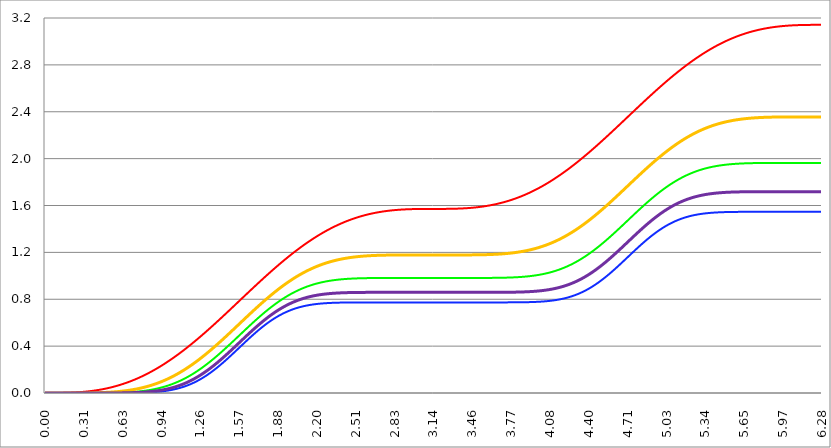
| Category | Series 1 | Series 0 | Series 2 | Series 3 | Series 4 |
|---|---|---|---|---|---|
| 0.0 | 0 | 0 | 0 | 0 | 0 |
| 0.00314159265358979 | 0 | 0 | 0 | 0 | 0 |
| 0.00628318530717958 | 0 | 0 | 0 | 0 | 0 |
| 0.00942477796076938 | 0 | 0 | 0 | 0 | 0 |
| 0.0125663706143592 | 0 | 0 | 0 | 0 | 0 |
| 0.015707963267949 | 0 | 0 | 0 | 0 | 0 |
| 0.0188495559215388 | 0 | 0 | 0 | 0 | 0 |
| 0.0219911485751285 | 0 | 0 | 0 | 0 | 0 |
| 0.0251327412287183 | 0 | 0 | 0 | 0 | 0 |
| 0.0282743338823081 | 0 | 0 | 0 | 0 | 0 |
| 0.0314159265358979 | 0 | 0 | 0 | 0 | 0 |
| 0.0345575191894877 | 0 | 0 | 0 | 0 | 0 |
| 0.0376991118430775 | 0 | 0 | 0 | 0 | 0 |
| 0.0408407044966673 | 0 | 0 | 0 | 0 | 0 |
| 0.0439822971502571 | 0 | 0 | 0 | 0 | 0 |
| 0.0471238898038469 | 0 | 0 | 0 | 0 | 0 |
| 0.0502654824574367 | 0 | 0 | 0 | 0 | 0 |
| 0.0534070751110265 | 0 | 0 | 0 | 0 | 0 |
| 0.0565486677646163 | 0 | 0 | 0 | 0 | 0 |
| 0.059690260418206 | 0 | 0 | 0 | 0 | 0 |
| 0.0628318530717958 | 0 | 0 | 0 | 0 | 0 |
| 0.0659734457253856 | 0 | 0 | 0 | 0 | 0 |
| 0.0691150383789754 | 0 | 0 | 0 | 0 | 0 |
| 0.0722566310325652 | 0 | 0 | 0 | 0 | 0 |
| 0.075398223686155 | 0 | 0 | 0 | 0 | 0 |
| 0.0785398163397448 | 0 | 0 | 0 | 0 | 0 |
| 0.0816814089933346 | 0 | 0 | 0 | 0 | 0 |
| 0.0848230016469244 | 0 | 0 | 0 | 0 | 0 |
| 0.0879645943005142 | 0 | 0 | 0 | 0 | 0 |
| 0.091106186954104 | 0 | 0 | 0 | 0 | 0 |
| 0.0942477796076937 | 0 | 0 | 0 | 0 | 0 |
| 0.0973893722612835 | 0 | 0 | 0 | 0 | 0 |
| 0.100530964914873 | 0 | 0 | 0 | 0 | 0 |
| 0.103672557568463 | 0 | 0 | 0 | 0 | 0 |
| 0.106814150222053 | 0 | 0 | 0 | 0 | 0 |
| 0.109955742875643 | 0 | 0 | 0 | 0 | 0 |
| 0.113097335529233 | 0 | 0 | 0 | 0 | 0 |
| 0.116238928182822 | 0.001 | 0 | 0 | 0 | 0 |
| 0.119380520836412 | 0.001 | 0 | 0 | 0 | 0 |
| 0.122522113490002 | 0.001 | 0 | 0 | 0 | 0 |
| 0.125663706143592 | 0.001 | 0 | 0 | 0 | 0 |
| 0.128805298797181 | 0.001 | 0 | 0 | 0 | 0 |
| 0.131946891450771 | 0.001 | 0 | 0 | 0 | 0 |
| 0.135088484104361 | 0.001 | 0 | 0 | 0 | 0 |
| 0.138230076757951 | 0.001 | 0 | 0 | 0 | 0 |
| 0.141371669411541 | 0.001 | 0 | 0 | 0 | 0 |
| 0.14451326206513 | 0.001 | 0 | 0 | 0 | 0 |
| 0.14765485471872 | 0.001 | 0 | 0 | 0 | 0 |
| 0.15079644737231 | 0.001 | 0 | 0 | 0 | 0 |
| 0.1539380400259 | 0.001 | 0 | 0 | 0 | 0 |
| 0.15707963267949 | 0.001 | 0 | 0 | 0 | 0 |
| 0.160221225333079 | 0.001 | 0 | 0 | 0 | 0 |
| 0.163362817986669 | 0.001 | 0 | 0 | 0 | 0 |
| 0.166504410640259 | 0.002 | 0 | 0 | 0 | 0 |
| 0.169646003293849 | 0.002 | 0 | 0 | 0 | 0 |
| 0.172787595947439 | 0.002 | 0 | 0 | 0 | 0 |
| 0.175929188601028 | 0.002 | 0 | 0 | 0 | 0 |
| 0.179070781254618 | 0.002 | 0 | 0 | 0 | 0 |
| 0.182212373908208 | 0.002 | 0 | 0 | 0 | 0 |
| 0.185353966561798 | 0.002 | 0 | 0 | 0 | 0 |
| 0.188495559215388 | 0.002 | 0 | 0 | 0 | 0 |
| 0.191637151868977 | 0.002 | 0 | 0 | 0 | 0 |
| 0.194778744522567 | 0.002 | 0 | 0 | 0 | 0 |
| 0.197920337176157 | 0.003 | 0 | 0 | 0 | 0 |
| 0.201061929829747 | 0.003 | 0 | 0 | 0 | 0 |
| 0.204203522483336 | 0.003 | 0 | 0 | 0 | 0 |
| 0.207345115136926 | 0.003 | 0 | 0 | 0 | 0 |
| 0.210486707790516 | 0.003 | 0 | 0 | 0 | 0 |
| 0.213628300444106 | 0.003 | 0 | 0 | 0 | 0 |
| 0.216769893097696 | 0.003 | 0 | 0 | 0 | 0 |
| 0.219911485751285 | 0.004 | 0 | 0 | 0 | 0 |
| 0.223053078404875 | 0.004 | 0 | 0 | 0 | 0 |
| 0.226194671058465 | 0.004 | 0 | 0 | 0 | 0 |
| 0.229336263712055 | 0.004 | 0 | 0 | 0 | 0 |
| 0.232477856365645 | 0.004 | 0 | 0 | 0 | 0 |
| 0.235619449019234 | 0.004 | 0 | 0 | 0 | 0 |
| 0.238761041672824 | 0.004 | 0 | 0 | 0 | 0 |
| 0.241902634326414 | 0.005 | 0 | 0 | 0 | 0 |
| 0.245044226980004 | 0.005 | 0 | 0 | 0 | 0 |
| 0.248185819633594 | 0.005 | 0 | 0 | 0 | 0 |
| 0.251327412287183 | 0.005 | 0 | 0 | 0 | 0 |
| 0.254469004940773 | 0.005 | 0 | 0 | 0 | 0 |
| 0.257610597594363 | 0.006 | 0 | 0 | 0 | 0 |
| 0.260752190247953 | 0.006 | 0 | 0 | 0 | 0 |
| 0.263893782901543 | 0.006 | 0 | 0 | 0 | 0 |
| 0.267035375555132 | 0.006 | 0 | 0 | 0 | 0 |
| 0.270176968208722 | 0.006 | 0 | 0 | 0 | 0 |
| 0.273318560862312 | 0.007 | 0 | 0 | 0 | 0 |
| 0.276460153515902 | 0.007 | 0 | 0 | 0 | 0 |
| 0.279601746169492 | 0.007 | 0 | 0 | 0 | 0 |
| 0.282743338823082 | 0.007 | 0 | 0 | 0 | 0 |
| 0.285884931476671 | 0.008 | 0 | 0 | 0 | 0 |
| 0.289026524130261 | 0.008 | 0 | 0 | 0 | 0 |
| 0.292168116783851 | 0.008 | 0 | 0 | 0 | 0 |
| 0.295309709437441 | 0.008 | 0 | 0 | 0 | 0 |
| 0.298451302091031 | 0.009 | 0 | 0 | 0 | 0 |
| 0.30159289474462 | 0.009 | 0 | 0 | 0 | 0 |
| 0.30473448739821 | 0.009 | 0 | 0 | 0.001 | 0 |
| 0.3078760800518 | 0.01 | 0 | 0 | 0.001 | 0 |
| 0.31101767270539 | 0.01 | 0 | 0 | 0.001 | 0 |
| 0.31415926535898 | 0.01 | 0 | 0 | 0.001 | 0 |
| 0.31730085801257 | 0.01 | 0 | 0 | 0.001 | 0 |
| 0.320442450666159 | 0.011 | 0 | 0 | 0.001 | 0 |
| 0.323584043319749 | 0.011 | 0 | 0 | 0.001 | 0 |
| 0.326725635973339 | 0.011 | 0 | 0 | 0.001 | 0 |
| 0.329867228626929 | 0.012 | 0 | 0 | 0.001 | 0 |
| 0.333008821280519 | 0.012 | 0 | 0 | 0.001 | 0 |
| 0.336150413934108 | 0.012 | 0 | 0 | 0.001 | 0 |
| 0.339292006587698 | 0.013 | 0 | 0 | 0.001 | 0 |
| 0.342433599241288 | 0.013 | 0 | 0 | 0.001 | 0 |
| 0.345575191894878 | 0.013 | 0 | 0 | 0.001 | 0 |
| 0.348716784548468 | 0.014 | 0 | 0 | 0.001 | 0 |
| 0.351858377202058 | 0.014 | 0 | 0 | 0.001 | 0 |
| 0.354999969855647 | 0.015 | 0 | 0 | 0.001 | 0 |
| 0.358141562509237 | 0.015 | 0 | 0 | 0.001 | 0 |
| 0.361283155162827 | 0.015 | 0 | 0 | 0.001 | 0 |
| 0.364424747816417 | 0.016 | 0 | 0 | 0.001 | 0 |
| 0.367566340470007 | 0.016 | 0 | 0 | 0.001 | 0 |
| 0.370707933123597 | 0.017 | 0 | 0 | 0.001 | 0 |
| 0.373849525777186 | 0.017 | 0 | 0 | 0.001 | 0 |
| 0.376991118430776 | 0.017 | 0 | 0 | 0.001 | 0 |
| 0.380132711084366 | 0.018 | 0 | 0 | 0.001 | 0 |
| 0.383274303737956 | 0.018 | 0 | 0 | 0.002 | 0 |
| 0.386415896391546 | 0.019 | 0 | 0 | 0.002 | 0 |
| 0.389557489045135 | 0.019 | 0 | 0 | 0.002 | 0 |
| 0.392699081698725 | 0.02 | 0 | 0 | 0.002 | 0 |
| 0.395840674352315 | 0.02 | 0 | 0 | 0.002 | 0 |
| 0.398982267005905 | 0.021 | 0 | 0 | 0.002 | 0 |
| 0.402123859659495 | 0.021 | 0 | 0 | 0.002 | 0 |
| 0.405265452313085 | 0.021 | 0 | 0 | 0.002 | 0 |
| 0.408407044966674 | 0.022 | 0 | 0 | 0.002 | 0 |
| 0.411548637620264 | 0.022 | 0 | 0 | 0.002 | 0 |
| 0.414690230273854 | 0.023 | 0 | 0 | 0.002 | 0 |
| 0.417831822927444 | 0.023 | 0 | 0 | 0.002 | 0 |
| 0.420973415581034 | 0.024 | 0 | 0 | 0.002 | 0 |
| 0.424115008234623 | 0.025 | 0 | 0 | 0.003 | 0 |
| 0.427256600888213 | 0.025 | 0 | 0 | 0.003 | 0 |
| 0.430398193541803 | 0.026 | 0 | 0 | 0.003 | 0 |
| 0.433539786195393 | 0.026 | 0 | 0 | 0.003 | 0 |
| 0.436681378848983 | 0.027 | 0 | 0 | 0.003 | 0 |
| 0.439822971502573 | 0.027 | 0 | 0 | 0.003 | 0 |
| 0.442964564156162 | 0.028 | 0 | 0 | 0.003 | 0 |
| 0.446106156809752 | 0.028 | 0 | 0 | 0.003 | 0 |
| 0.449247749463342 | 0.029 | 0 | 0 | 0.003 | 0 |
| 0.452389342116932 | 0.03 | 0 | 0 | 0.003 | 0 |
| 0.455530934770522 | 0.03 | 0 | 0 | 0.004 | 0 |
| 0.458672527424111 | 0.031 | 0.001 | 0 | 0.004 | 0 |
| 0.461814120077701 | 0.031 | 0.001 | 0 | 0.004 | 0 |
| 0.464955712731291 | 0.032 | 0.001 | 0 | 0.004 | 0 |
| 0.468097305384881 | 0.033 | 0.001 | 0 | 0.004 | 0 |
| 0.471238898038471 | 0.033 | 0.001 | 0 | 0.004 | 0 |
| 0.474380490692061 | 0.034 | 0.001 | 0 | 0.004 | 0 |
| 0.47752208334565 | 0.035 | 0.001 | 0 | 0.004 | 0 |
| 0.48066367599924 | 0.035 | 0.001 | 0 | 0.005 | 0 |
| 0.48380526865283 | 0.036 | 0.001 | 0 | 0.005 | 0 |
| 0.48694686130642 | 0.037 | 0.001 | 0 | 0.005 | 0 |
| 0.49008845396001 | 0.037 | 0.001 | 0 | 0.005 | 0 |
| 0.493230046613599 | 0.038 | 0.001 | 0 | 0.005 | 0 |
| 0.496371639267189 | 0.039 | 0.001 | 0 | 0.005 | 0 |
| 0.499513231920779 | 0.04 | 0.001 | 0 | 0.006 | 0 |
| 0.502654824574369 | 0.04 | 0.001 | 0 | 0.006 | 0 |
| 0.505796417227959 | 0.041 | 0.001 | 0 | 0.006 | 0 |
| 0.508938009881549 | 0.042 | 0.001 | 0 | 0.006 | 0 |
| 0.512079602535138 | 0.042 | 0.001 | 0 | 0.006 | 0 |
| 0.515221195188728 | 0.043 | 0.001 | 0 | 0.006 | 0 |
| 0.518362787842318 | 0.044 | 0.001 | 0 | 0.007 | 0 |
| 0.521504380495908 | 0.045 | 0.001 | 0 | 0.007 | 0 |
| 0.524645973149498 | 0.046 | 0.001 | 0 | 0.007 | 0 |
| 0.527787565803087 | 0.046 | 0.001 | 0 | 0.007 | 0 |
| 0.530929158456677 | 0.047 | 0.001 | 0 | 0.007 | 0 |
| 0.534070751110267 | 0.048 | 0.001 | 0 | 0.008 | 0 |
| 0.537212343763857 | 0.049 | 0.001 | 0 | 0.008 | 0 |
| 0.540353936417447 | 0.05 | 0.002 | 0 | 0.008 | 0 |
| 0.543495529071037 | 0.05 | 0.002 | 0 | 0.008 | 0 |
| 0.546637121724626 | 0.051 | 0.002 | 0 | 0.008 | 0 |
| 0.549778714378216 | 0.052 | 0.002 | 0 | 0.009 | 0 |
| 0.552920307031806 | 0.053 | 0.002 | 0 | 0.009 | 0 |
| 0.556061899685396 | 0.054 | 0.002 | 0 | 0.009 | 0 |
| 0.559203492338986 | 0.055 | 0.002 | 0 | 0.009 | 0 |
| 0.562345084992576 | 0.056 | 0.002 | 0 | 0.01 | 0 |
| 0.565486677646165 | 0.057 | 0.002 | 0 | 0.01 | 0 |
| 0.568628270299755 | 0.057 | 0.002 | 0 | 0.01 | 0 |
| 0.571769862953345 | 0.058 | 0.002 | 0 | 0.01 | 0.001 |
| 0.574911455606935 | 0.059 | 0.002 | 0 | 0.011 | 0.001 |
| 0.578053048260525 | 0.06 | 0.002 | 0 | 0.011 | 0.001 |
| 0.581194640914114 | 0.061 | 0.002 | 0 | 0.011 | 0.001 |
| 0.584336233567704 | 0.062 | 0.003 | 0 | 0.012 | 0.001 |
| 0.587477826221294 | 0.063 | 0.003 | 0 | 0.012 | 0.001 |
| 0.590619418874884 | 0.064 | 0.003 | 0 | 0.012 | 0.001 |
| 0.593761011528474 | 0.065 | 0.003 | 0 | 0.012 | 0.001 |
| 0.596902604182064 | 0.066 | 0.003 | 0 | 0.013 | 0.001 |
| 0.600044196835653 | 0.067 | 0.003 | 0 | 0.013 | 0.001 |
| 0.603185789489243 | 0.068 | 0.003 | 0 | 0.013 | 0.001 |
| 0.606327382142833 | 0.069 | 0.003 | 0 | 0.014 | 0.001 |
| 0.609468974796423 | 0.07 | 0.003 | 0 | 0.014 | 0.001 |
| 0.612610567450013 | 0.071 | 0.003 | 0 | 0.014 | 0.001 |
| 0.615752160103602 | 0.072 | 0.004 | 0 | 0.015 | 0.001 |
| 0.618893752757192 | 0.073 | 0.004 | 0 | 0.015 | 0.001 |
| 0.622035345410782 | 0.074 | 0.004 | 0 | 0.015 | 0.001 |
| 0.625176938064372 | 0.075 | 0.004 | 0 | 0.016 | 0.001 |
| 0.628318530717962 | 0.076 | 0.004 | 0 | 0.016 | 0.001 |
| 0.631460123371551 | 0.077 | 0.004 | 0 | 0.017 | 0.001 |
| 0.634601716025141 | 0.079 | 0.004 | 0 | 0.017 | 0.001 |
| 0.637743308678731 | 0.08 | 0.004 | 0 | 0.017 | 0.001 |
| 0.640884901332321 | 0.081 | 0.005 | 0 | 0.018 | 0.001 |
| 0.644026493985911 | 0.082 | 0.005 | 0 | 0.018 | 0.001 |
| 0.647168086639501 | 0.083 | 0.005 | 0 | 0.019 | 0.001 |
| 0.65030967929309 | 0.084 | 0.005 | 0 | 0.019 | 0.001 |
| 0.65345127194668 | 0.085 | 0.005 | 0 | 0.019 | 0.002 |
| 0.65659286460027 | 0.087 | 0.005 | 0 | 0.02 | 0.002 |
| 0.65973445725386 | 0.088 | 0.006 | 0.001 | 0.02 | 0.002 |
| 0.66287604990745 | 0.089 | 0.006 | 0.001 | 0.021 | 0.002 |
| 0.666017642561039 | 0.09 | 0.006 | 0.001 | 0.021 | 0.002 |
| 0.669159235214629 | 0.091 | 0.006 | 0.001 | 0.022 | 0.002 |
| 0.672300827868219 | 0.093 | 0.006 | 0.001 | 0.022 | 0.002 |
| 0.675442420521809 | 0.094 | 0.006 | 0.001 | 0.023 | 0.002 |
| 0.678584013175399 | 0.095 | 0.007 | 0.001 | 0.023 | 0.002 |
| 0.681725605828989 | 0.096 | 0.007 | 0.001 | 0.024 | 0.002 |
| 0.684867198482578 | 0.097 | 0.007 | 0.001 | 0.024 | 0.002 |
| 0.688008791136168 | 0.099 | 0.007 | 0.001 | 0.025 | 0.002 |
| 0.691150383789758 | 0.1 | 0.007 | 0.001 | 0.025 | 0.002 |
| 0.694291976443348 | 0.101 | 0.008 | 0.001 | 0.026 | 0.002 |
| 0.697433569096938 | 0.103 | 0.008 | 0.001 | 0.026 | 0.003 |
| 0.700575161750528 | 0.104 | 0.008 | 0.001 | 0.027 | 0.003 |
| 0.703716754404117 | 0.105 | 0.008 | 0.001 | 0.027 | 0.003 |
| 0.706858347057707 | 0.107 | 0.009 | 0.001 | 0.028 | 0.003 |
| 0.709999939711297 | 0.108 | 0.009 | 0.001 | 0.028 | 0.003 |
| 0.713141532364887 | 0.109 | 0.009 | 0.001 | 0.029 | 0.003 |
| 0.716283125018477 | 0.111 | 0.009 | 0.001 | 0.03 | 0.003 |
| 0.719424717672066 | 0.112 | 0.01 | 0.001 | 0.03 | 0.003 |
| 0.722566310325656 | 0.113 | 0.01 | 0.001 | 0.031 | 0.003 |
| 0.725707902979246 | 0.115 | 0.01 | 0.001 | 0.031 | 0.003 |
| 0.728849495632836 | 0.116 | 0.01 | 0.001 | 0.032 | 0.004 |
| 0.731991088286426 | 0.117 | 0.011 | 0.001 | 0.033 | 0.004 |
| 0.735132680940016 | 0.119 | 0.011 | 0.001 | 0.033 | 0.004 |
| 0.738274273593605 | 0.12 | 0.011 | 0.001 | 0.034 | 0.004 |
| 0.741415866247195 | 0.122 | 0.011 | 0.002 | 0.034 | 0.004 |
| 0.744557458900785 | 0.123 | 0.012 | 0.002 | 0.035 | 0.004 |
| 0.747699051554375 | 0.125 | 0.012 | 0.002 | 0.036 | 0.004 |
| 0.750840644207965 | 0.126 | 0.012 | 0.002 | 0.036 | 0.005 |
| 0.753982236861554 | 0.127 | 0.013 | 0.002 | 0.037 | 0.005 |
| 0.757123829515144 | 0.129 | 0.013 | 0.002 | 0.038 | 0.005 |
| 0.760265422168734 | 0.13 | 0.013 | 0.002 | 0.039 | 0.005 |
| 0.763407014822324 | 0.132 | 0.014 | 0.002 | 0.039 | 0.005 |
| 0.766548607475914 | 0.133 | 0.014 | 0.002 | 0.04 | 0.005 |
| 0.769690200129504 | 0.135 | 0.014 | 0.002 | 0.041 | 0.006 |
| 0.772831792783093 | 0.136 | 0.015 | 0.002 | 0.041 | 0.006 |
| 0.775973385436683 | 0.138 | 0.015 | 0.002 | 0.042 | 0.006 |
| 0.779114978090273 | 0.14 | 0.015 | 0.002 | 0.043 | 0.006 |
| 0.782256570743863 | 0.141 | 0.016 | 0.003 | 0.044 | 0.006 |
| 0.785398163397453 | 0.143 | 0.016 | 0.003 | 0.045 | 0.006 |
| 0.788539756051042 | 0.144 | 0.017 | 0.003 | 0.045 | 0.007 |
| 0.791681348704632 | 0.146 | 0.017 | 0.003 | 0.046 | 0.007 |
| 0.794822941358222 | 0.147 | 0.017 | 0.003 | 0.047 | 0.007 |
| 0.797964534011812 | 0.149 | 0.018 | 0.003 | 0.048 | 0.007 |
| 0.801106126665402 | 0.151 | 0.018 | 0.003 | 0.049 | 0.007 |
| 0.804247719318992 | 0.152 | 0.019 | 0.003 | 0.049 | 0.008 |
| 0.807389311972581 | 0.154 | 0.019 | 0.003 | 0.05 | 0.008 |
| 0.810530904626171 | 0.156 | 0.02 | 0.004 | 0.051 | 0.008 |
| 0.813672497279761 | 0.157 | 0.02 | 0.004 | 0.052 | 0.008 |
| 0.816814089933351 | 0.159 | 0.021 | 0.004 | 0.053 | 0.009 |
| 0.819955682586941 | 0.161 | 0.021 | 0.004 | 0.054 | 0.009 |
| 0.823097275240531 | 0.162 | 0.022 | 0.004 | 0.055 | 0.009 |
| 0.82623886789412 | 0.164 | 0.022 | 0.004 | 0.056 | 0.009 |
| 0.82938046054771 | 0.166 | 0.023 | 0.004 | 0.057 | 0.01 |
| 0.8325220532013 | 0.167 | 0.023 | 0.005 | 0.057 | 0.01 |
| 0.83566364585489 | 0.169 | 0.024 | 0.005 | 0.058 | 0.01 |
| 0.83880523850848 | 0.171 | 0.024 | 0.005 | 0.059 | 0.011 |
| 0.841946831162069 | 0.173 | 0.025 | 0.005 | 0.06 | 0.011 |
| 0.845088423815659 | 0.174 | 0.025 | 0.005 | 0.061 | 0.011 |
| 0.848230016469249 | 0.176 | 0.026 | 0.005 | 0.062 | 0.011 |
| 0.851371609122839 | 0.178 | 0.026 | 0.006 | 0.063 | 0.012 |
| 0.854513201776429 | 0.18 | 0.027 | 0.006 | 0.064 | 0.012 |
| 0.857654794430019 | 0.181 | 0.027 | 0.006 | 0.065 | 0.012 |
| 0.860796387083608 | 0.183 | 0.028 | 0.006 | 0.066 | 0.013 |
| 0.863937979737198 | 0.185 | 0.029 | 0.006 | 0.067 | 0.013 |
| 0.867079572390788 | 0.187 | 0.029 | 0.007 | 0.068 | 0.013 |
| 0.870221165044378 | 0.189 | 0.03 | 0.007 | 0.07 | 0.014 |
| 0.873362757697968 | 0.191 | 0.031 | 0.007 | 0.071 | 0.014 |
| 0.876504350351557 | 0.192 | 0.031 | 0.007 | 0.072 | 0.015 |
| 0.879645943005147 | 0.194 | 0.032 | 0.007 | 0.073 | 0.015 |
| 0.882787535658737 | 0.196 | 0.032 | 0.008 | 0.074 | 0.015 |
| 0.885929128312327 | 0.198 | 0.033 | 0.008 | 0.075 | 0.016 |
| 0.889070720965917 | 0.2 | 0.034 | 0.008 | 0.076 | 0.016 |
| 0.892212313619507 | 0.202 | 0.035 | 0.008 | 0.077 | 0.017 |
| 0.895353906273096 | 0.204 | 0.035 | 0.009 | 0.078 | 0.017 |
| 0.898495498926686 | 0.206 | 0.036 | 0.009 | 0.08 | 0.017 |
| 0.901637091580276 | 0.208 | 0.037 | 0.009 | 0.081 | 0.018 |
| 0.904778684233866 | 0.209 | 0.037 | 0.009 | 0.082 | 0.018 |
| 0.907920276887456 | 0.211 | 0.038 | 0.01 | 0.083 | 0.019 |
| 0.911061869541045 | 0.213 | 0.039 | 0.01 | 0.084 | 0.019 |
| 0.914203462194635 | 0.215 | 0.04 | 0.01 | 0.086 | 0.02 |
| 0.917345054848225 | 0.217 | 0.04 | 0.011 | 0.087 | 0.02 |
| 0.920486647501815 | 0.219 | 0.041 | 0.011 | 0.088 | 0.021 |
| 0.923628240155405 | 0.221 | 0.042 | 0.011 | 0.089 | 0.021 |
| 0.926769832808995 | 0.223 | 0.043 | 0.012 | 0.091 | 0.022 |
| 0.929911425462584 | 0.225 | 0.044 | 0.012 | 0.092 | 0.022 |
| 0.933053018116174 | 0.227 | 0.045 | 0.012 | 0.093 | 0.023 |
| 0.936194610769764 | 0.229 | 0.045 | 0.013 | 0.095 | 0.023 |
| 0.939336203423354 | 0.231 | 0.046 | 0.013 | 0.096 | 0.024 |
| 0.942477796076944 | 0.233 | 0.047 | 0.013 | 0.097 | 0.025 |
| 0.945619388730533 | 0.236 | 0.048 | 0.014 | 0.099 | 0.025 |
| 0.948760981384123 | 0.238 | 0.049 | 0.014 | 0.1 | 0.026 |
| 0.951902574037713 | 0.24 | 0.05 | 0.015 | 0.101 | 0.026 |
| 0.955044166691303 | 0.242 | 0.051 | 0.015 | 0.103 | 0.027 |
| 0.958185759344893 | 0.244 | 0.052 | 0.015 | 0.104 | 0.028 |
| 0.961327351998483 | 0.246 | 0.053 | 0.016 | 0.106 | 0.028 |
| 0.964468944652072 | 0.248 | 0.054 | 0.016 | 0.107 | 0.029 |
| 0.967610537305662 | 0.25 | 0.055 | 0.017 | 0.108 | 0.03 |
| 0.970752129959252 | 0.252 | 0.056 | 0.017 | 0.11 | 0.03 |
| 0.973893722612842 | 0.255 | 0.057 | 0.018 | 0.111 | 0.031 |
| 0.977035315266432 | 0.257 | 0.058 | 0.018 | 0.113 | 0.032 |
| 0.980176907920022 | 0.259 | 0.059 | 0.019 | 0.114 | 0.032 |
| 0.983318500573611 | 0.261 | 0.06 | 0.019 | 0.116 | 0.033 |
| 0.986460093227201 | 0.263 | 0.061 | 0.02 | 0.117 | 0.034 |
| 0.989601685880791 | 0.265 | 0.062 | 0.02 | 0.119 | 0.034 |
| 0.992743278534381 | 0.268 | 0.063 | 0.021 | 0.12 | 0.035 |
| 0.995884871187971 | 0.27 | 0.064 | 0.021 | 0.122 | 0.036 |
| 0.99902646384156 | 0.272 | 0.065 | 0.022 | 0.124 | 0.037 |
| 1.00216805649515 | 0.274 | 0.066 | 0.022 | 0.125 | 0.038 |
| 1.00530964914874 | 0.276 | 0.067 | 0.023 | 0.127 | 0.038 |
| 1.00845124180233 | 0.279 | 0.068 | 0.023 | 0.128 | 0.039 |
| 1.01159283445592 | 0.281 | 0.07 | 0.024 | 0.13 | 0.04 |
| 1.01473442710951 | 0.283 | 0.071 | 0.025 | 0.132 | 0.041 |
| 1.017876019763099 | 0.285 | 0.072 | 0.025 | 0.133 | 0.042 |
| 1.021017612416689 | 0.288 | 0.073 | 0.026 | 0.135 | 0.043 |
| 1.02415920507028 | 0.29 | 0.074 | 0.027 | 0.137 | 0.043 |
| 1.027300797723869 | 0.292 | 0.076 | 0.027 | 0.138 | 0.044 |
| 1.030442390377459 | 0.295 | 0.077 | 0.028 | 0.14 | 0.045 |
| 1.033583983031048 | 0.297 | 0.078 | 0.029 | 0.142 | 0.046 |
| 1.036725575684638 | 0.299 | 0.079 | 0.029 | 0.143 | 0.047 |
| 1.039867168338228 | 0.302 | 0.081 | 0.03 | 0.145 | 0.048 |
| 1.043008760991818 | 0.304 | 0.082 | 0.031 | 0.147 | 0.049 |
| 1.046150353645408 | 0.306 | 0.083 | 0.031 | 0.149 | 0.05 |
| 1.049291946298998 | 0.309 | 0.085 | 0.032 | 0.15 | 0.051 |
| 1.052433538952587 | 0.311 | 0.086 | 0.033 | 0.152 | 0.052 |
| 1.055575131606177 | 0.313 | 0.087 | 0.034 | 0.154 | 0.053 |
| 1.058716724259767 | 0.316 | 0.089 | 0.034 | 0.156 | 0.054 |
| 1.061858316913357 | 0.318 | 0.09 | 0.035 | 0.158 | 0.055 |
| 1.064999909566947 | 0.321 | 0.091 | 0.036 | 0.159 | 0.056 |
| 1.068141502220536 | 0.323 | 0.093 | 0.037 | 0.161 | 0.057 |
| 1.071283094874126 | 0.325 | 0.094 | 0.038 | 0.163 | 0.058 |
| 1.074424687527716 | 0.328 | 0.096 | 0.039 | 0.165 | 0.06 |
| 1.077566280181306 | 0.33 | 0.097 | 0.04 | 0.167 | 0.061 |
| 1.080707872834896 | 0.333 | 0.099 | 0.04 | 0.169 | 0.062 |
| 1.083849465488486 | 0.335 | 0.1 | 0.041 | 0.171 | 0.063 |
| 1.086991058142075 | 0.338 | 0.102 | 0.042 | 0.173 | 0.064 |
| 1.090132650795665 | 0.34 | 0.103 | 0.043 | 0.174 | 0.065 |
| 1.093274243449255 | 0.343 | 0.105 | 0.044 | 0.176 | 0.067 |
| 1.096415836102845 | 0.345 | 0.106 | 0.045 | 0.178 | 0.068 |
| 1.099557428756435 | 0.348 | 0.108 | 0.046 | 0.18 | 0.069 |
| 1.102699021410025 | 0.35 | 0.109 | 0.047 | 0.182 | 0.07 |
| 1.105840614063614 | 0.353 | 0.111 | 0.048 | 0.184 | 0.072 |
| 1.108982206717204 | 0.355 | 0.113 | 0.049 | 0.186 | 0.073 |
| 1.112123799370794 | 0.358 | 0.114 | 0.05 | 0.188 | 0.074 |
| 1.115265392024384 | 0.36 | 0.116 | 0.051 | 0.19 | 0.075 |
| 1.118406984677974 | 0.363 | 0.118 | 0.052 | 0.192 | 0.077 |
| 1.121548577331563 | 0.365 | 0.119 | 0.053 | 0.195 | 0.078 |
| 1.124690169985153 | 0.368 | 0.121 | 0.055 | 0.197 | 0.08 |
| 1.127831762638743 | 0.37 | 0.123 | 0.056 | 0.199 | 0.081 |
| 1.130973355292333 | 0.373 | 0.124 | 0.057 | 0.201 | 0.082 |
| 1.134114947945923 | 0.375 | 0.126 | 0.058 | 0.203 | 0.084 |
| 1.137256540599513 | 0.378 | 0.128 | 0.059 | 0.205 | 0.085 |
| 1.140398133253102 | 0.381 | 0.13 | 0.06 | 0.207 | 0.087 |
| 1.143539725906692 | 0.383 | 0.131 | 0.062 | 0.209 | 0.088 |
| 1.146681318560282 | 0.386 | 0.133 | 0.063 | 0.211 | 0.09 |
| 1.149822911213872 | 0.388 | 0.135 | 0.064 | 0.214 | 0.091 |
| 1.152964503867462 | 0.391 | 0.137 | 0.065 | 0.216 | 0.093 |
| 1.156106096521051 | 0.394 | 0.139 | 0.067 | 0.218 | 0.094 |
| 1.159247689174641 | 0.396 | 0.14 | 0.068 | 0.22 | 0.096 |
| 1.162389281828231 | 0.399 | 0.142 | 0.069 | 0.222 | 0.097 |
| 1.165530874481821 | 0.402 | 0.144 | 0.071 | 0.225 | 0.099 |
| 1.168672467135411 | 0.404 | 0.146 | 0.072 | 0.227 | 0.1 |
| 1.171814059789001 | 0.407 | 0.148 | 0.073 | 0.229 | 0.102 |
| 1.17495565244259 | 0.41 | 0.15 | 0.075 | 0.231 | 0.104 |
| 1.17809724509618 | 0.412 | 0.152 | 0.076 | 0.234 | 0.105 |
| 1.18123883774977 | 0.415 | 0.154 | 0.078 | 0.236 | 0.107 |
| 1.18438043040336 | 0.418 | 0.156 | 0.079 | 0.238 | 0.109 |
| 1.18752202305695 | 0.42 | 0.158 | 0.08 | 0.241 | 0.11 |
| 1.190663615710539 | 0.423 | 0.16 | 0.082 | 0.243 | 0.112 |
| 1.193805208364129 | 0.426 | 0.162 | 0.083 | 0.245 | 0.114 |
| 1.19694680101772 | 0.428 | 0.164 | 0.085 | 0.248 | 0.116 |
| 1.200088393671309 | 0.431 | 0.166 | 0.087 | 0.25 | 0.118 |
| 1.203229986324899 | 0.434 | 0.168 | 0.088 | 0.252 | 0.119 |
| 1.206371578978489 | 0.437 | 0.17 | 0.09 | 0.255 | 0.121 |
| 1.209513171632078 | 0.439 | 0.172 | 0.091 | 0.257 | 0.123 |
| 1.212654764285668 | 0.442 | 0.174 | 0.093 | 0.26 | 0.125 |
| 1.215796356939258 | 0.445 | 0.176 | 0.095 | 0.262 | 0.127 |
| 1.218937949592848 | 0.448 | 0.179 | 0.096 | 0.265 | 0.129 |
| 1.222079542246438 | 0.45 | 0.181 | 0.098 | 0.267 | 0.13 |
| 1.225221134900027 | 0.453 | 0.183 | 0.1 | 0.269 | 0.132 |
| 1.228362727553617 | 0.456 | 0.185 | 0.101 | 0.272 | 0.134 |
| 1.231504320207207 | 0.459 | 0.187 | 0.103 | 0.274 | 0.136 |
| 1.234645912860797 | 0.462 | 0.189 | 0.105 | 0.277 | 0.138 |
| 1.237787505514387 | 0.464 | 0.192 | 0.107 | 0.279 | 0.14 |
| 1.240929098167977 | 0.467 | 0.194 | 0.108 | 0.282 | 0.142 |
| 1.244070690821566 | 0.47 | 0.196 | 0.11 | 0.284 | 0.144 |
| 1.247212283475156 | 0.473 | 0.198 | 0.112 | 0.287 | 0.146 |
| 1.250353876128746 | 0.476 | 0.201 | 0.114 | 0.289 | 0.148 |
| 1.253495468782336 | 0.479 | 0.203 | 0.116 | 0.292 | 0.15 |
| 1.256637061435926 | 0.481 | 0.205 | 0.118 | 0.295 | 0.153 |
| 1.259778654089515 | 0.484 | 0.208 | 0.12 | 0.297 | 0.155 |
| 1.262920246743105 | 0.487 | 0.21 | 0.121 | 0.3 | 0.157 |
| 1.266061839396695 | 0.49 | 0.212 | 0.123 | 0.302 | 0.159 |
| 1.269203432050285 | 0.493 | 0.215 | 0.125 | 0.305 | 0.161 |
| 1.272345024703875 | 0.496 | 0.217 | 0.127 | 0.308 | 0.163 |
| 1.275486617357465 | 0.499 | 0.22 | 0.129 | 0.31 | 0.165 |
| 1.278628210011054 | 0.501 | 0.222 | 0.131 | 0.313 | 0.168 |
| 1.281769802664644 | 0.504 | 0.224 | 0.133 | 0.315 | 0.17 |
| 1.284911395318234 | 0.507 | 0.227 | 0.136 | 0.318 | 0.172 |
| 1.288052987971824 | 0.51 | 0.229 | 0.138 | 0.321 | 0.174 |
| 1.291194580625414 | 0.513 | 0.232 | 0.14 | 0.323 | 0.177 |
| 1.294336173279003 | 0.516 | 0.234 | 0.142 | 0.326 | 0.179 |
| 1.297477765932593 | 0.519 | 0.237 | 0.144 | 0.329 | 0.181 |
| 1.300619358586183 | 0.522 | 0.239 | 0.146 | 0.332 | 0.184 |
| 1.303760951239773 | 0.525 | 0.242 | 0.148 | 0.334 | 0.186 |
| 1.306902543893363 | 0.528 | 0.244 | 0.151 | 0.337 | 0.188 |
| 1.310044136546953 | 0.53 | 0.247 | 0.153 | 0.34 | 0.191 |
| 1.313185729200542 | 0.533 | 0.249 | 0.155 | 0.342 | 0.193 |
| 1.316327321854132 | 0.536 | 0.252 | 0.157 | 0.345 | 0.196 |
| 1.319468914507722 | 0.539 | 0.255 | 0.16 | 0.348 | 0.198 |
| 1.322610507161312 | 0.542 | 0.257 | 0.162 | 0.351 | 0.2 |
| 1.325752099814902 | 0.545 | 0.26 | 0.164 | 0.354 | 0.203 |
| 1.328893692468491 | 0.548 | 0.262 | 0.166 | 0.356 | 0.205 |
| 1.332035285122081 | 0.551 | 0.265 | 0.169 | 0.359 | 0.208 |
| 1.335176877775671 | 0.554 | 0.268 | 0.171 | 0.362 | 0.21 |
| 1.338318470429261 | 0.557 | 0.27 | 0.174 | 0.365 | 0.213 |
| 1.341460063082851 | 0.56 | 0.273 | 0.176 | 0.368 | 0.215 |
| 1.344601655736441 | 0.563 | 0.276 | 0.178 | 0.37 | 0.218 |
| 1.34774324839003 | 0.566 | 0.278 | 0.181 | 0.373 | 0.22 |
| 1.35088484104362 | 0.569 | 0.281 | 0.183 | 0.376 | 0.223 |
| 1.35402643369721 | 0.572 | 0.284 | 0.186 | 0.379 | 0.226 |
| 1.3571680263508 | 0.575 | 0.287 | 0.188 | 0.382 | 0.228 |
| 1.36030961900439 | 0.578 | 0.289 | 0.191 | 0.385 | 0.231 |
| 1.363451211657979 | 0.581 | 0.292 | 0.193 | 0.388 | 0.234 |
| 1.36659280431157 | 0.584 | 0.295 | 0.196 | 0.39 | 0.236 |
| 1.369734396965159 | 0.587 | 0.298 | 0.198 | 0.393 | 0.239 |
| 1.372875989618749 | 0.59 | 0.3 | 0.201 | 0.396 | 0.241 |
| 1.376017582272339 | 0.593 | 0.303 | 0.203 | 0.399 | 0.244 |
| 1.379159174925929 | 0.596 | 0.306 | 0.206 | 0.402 | 0.247 |
| 1.382300767579518 | 0.599 | 0.309 | 0.209 | 0.405 | 0.25 |
| 1.385442360233108 | 0.602 | 0.312 | 0.211 | 0.408 | 0.252 |
| 1.388583952886698 | 0.605 | 0.315 | 0.214 | 0.411 | 0.255 |
| 1.391725545540288 | 0.608 | 0.317 | 0.217 | 0.414 | 0.258 |
| 1.394867138193878 | 0.611 | 0.32 | 0.219 | 0.417 | 0.261 |
| 1.398008730847468 | 0.614 | 0.323 | 0.222 | 0.42 | 0.263 |
| 1.401150323501057 | 0.617 | 0.326 | 0.225 | 0.423 | 0.266 |
| 1.404291916154647 | 0.62 | 0.329 | 0.227 | 0.426 | 0.269 |
| 1.407433508808237 | 0.623 | 0.332 | 0.23 | 0.429 | 0.272 |
| 1.410575101461827 | 0.627 | 0.335 | 0.233 | 0.432 | 0.275 |
| 1.413716694115417 | 0.63 | 0.338 | 0.236 | 0.435 | 0.277 |
| 1.416858286769006 | 0.633 | 0.341 | 0.239 | 0.438 | 0.28 |
| 1.419999879422596 | 0.636 | 0.343 | 0.241 | 0.441 | 0.283 |
| 1.423141472076186 | 0.639 | 0.346 | 0.244 | 0.444 | 0.286 |
| 1.426283064729776 | 0.642 | 0.349 | 0.247 | 0.447 | 0.289 |
| 1.429424657383366 | 0.645 | 0.352 | 0.25 | 0.45 | 0.292 |
| 1.432566250036956 | 0.648 | 0.355 | 0.253 | 0.453 | 0.295 |
| 1.435707842690545 | 0.651 | 0.358 | 0.255 | 0.456 | 0.298 |
| 1.438849435344135 | 0.654 | 0.361 | 0.258 | 0.459 | 0.301 |
| 1.441991027997725 | 0.657 | 0.364 | 0.261 | 0.462 | 0.304 |
| 1.445132620651315 | 0.66 | 0.367 | 0.264 | 0.465 | 0.306 |
| 1.448274213304905 | 0.663 | 0.37 | 0.267 | 0.468 | 0.309 |
| 1.451415805958494 | 0.667 | 0.373 | 0.27 | 0.471 | 0.312 |
| 1.454557398612084 | 0.67 | 0.376 | 0.273 | 0.474 | 0.315 |
| 1.457698991265674 | 0.673 | 0.379 | 0.276 | 0.477 | 0.318 |
| 1.460840583919264 | 0.676 | 0.382 | 0.279 | 0.48 | 0.321 |
| 1.463982176572854 | 0.679 | 0.385 | 0.282 | 0.483 | 0.324 |
| 1.467123769226444 | 0.682 | 0.388 | 0.285 | 0.486 | 0.327 |
| 1.470265361880033 | 0.685 | 0.391 | 0.288 | 0.489 | 0.33 |
| 1.473406954533623 | 0.688 | 0.394 | 0.291 | 0.492 | 0.333 |
| 1.476548547187213 | 0.691 | 0.397 | 0.294 | 0.495 | 0.336 |
| 1.479690139840803 | 0.695 | 0.401 | 0.297 | 0.498 | 0.339 |
| 1.482831732494393 | 0.698 | 0.404 | 0.3 | 0.502 | 0.342 |
| 1.485973325147982 | 0.701 | 0.407 | 0.303 | 0.505 | 0.345 |
| 1.489114917801572 | 0.704 | 0.41 | 0.306 | 0.508 | 0.349 |
| 1.492256510455162 | 0.707 | 0.413 | 0.309 | 0.511 | 0.352 |
| 1.495398103108752 | 0.71 | 0.416 | 0.312 | 0.514 | 0.355 |
| 1.498539695762342 | 0.713 | 0.419 | 0.315 | 0.517 | 0.358 |
| 1.501681288415932 | 0.716 | 0.422 | 0.318 | 0.52 | 0.361 |
| 1.504822881069521 | 0.72 | 0.425 | 0.321 | 0.523 | 0.364 |
| 1.507964473723111 | 0.723 | 0.428 | 0.324 | 0.526 | 0.367 |
| 1.511106066376701 | 0.726 | 0.431 | 0.327 | 0.529 | 0.37 |
| 1.514247659030291 | 0.729 | 0.435 | 0.33 | 0.533 | 0.373 |
| 1.517389251683881 | 0.732 | 0.438 | 0.333 | 0.536 | 0.376 |
| 1.520530844337471 | 0.735 | 0.441 | 0.337 | 0.539 | 0.379 |
| 1.52367243699106 | 0.738 | 0.444 | 0.34 | 0.542 | 0.383 |
| 1.52681402964465 | 0.741 | 0.447 | 0.343 | 0.545 | 0.386 |
| 1.52995562229824 | 0.745 | 0.45 | 0.346 | 0.548 | 0.389 |
| 1.53309721495183 | 0.748 | 0.453 | 0.349 | 0.551 | 0.392 |
| 1.53623880760542 | 0.751 | 0.456 | 0.352 | 0.555 | 0.395 |
| 1.539380400259009 | 0.754 | 0.459 | 0.355 | 0.558 | 0.398 |
| 1.542521992912599 | 0.757 | 0.463 | 0.358 | 0.561 | 0.401 |
| 1.545663585566189 | 0.76 | 0.466 | 0.361 | 0.564 | 0.404 |
| 1.548805178219779 | 0.763 | 0.469 | 0.365 | 0.567 | 0.408 |
| 1.551946770873369 | 0.767 | 0.472 | 0.368 | 0.57 | 0.411 |
| 1.555088363526959 | 0.77 | 0.475 | 0.371 | 0.573 | 0.414 |
| 1.558229956180548 | 0.773 | 0.478 | 0.374 | 0.576 | 0.417 |
| 1.561371548834138 | 0.776 | 0.481 | 0.377 | 0.58 | 0.42 |
| 1.564513141487728 | 0.779 | 0.485 | 0.38 | 0.583 | 0.423 |
| 1.567654734141318 | 0.782 | 0.488 | 0.383 | 0.586 | 0.426 |
| 1.570796326794908 | 0.785 | 0.491 | 0.387 | 0.589 | 0.43 |
| 1.573937919448497 | 0.789 | 0.494 | 0.39 | 0.592 | 0.433 |
| 1.577079512102087 | 0.792 | 0.497 | 0.393 | 0.595 | 0.436 |
| 1.580221104755677 | 0.795 | 0.5 | 0.396 | 0.598 | 0.439 |
| 1.583362697409267 | 0.798 | 0.503 | 0.399 | 0.602 | 0.442 |
| 1.586504290062857 | 0.801 | 0.507 | 0.402 | 0.605 | 0.445 |
| 1.589645882716447 | 0.804 | 0.51 | 0.405 | 0.608 | 0.448 |
| 1.592787475370036 | 0.807 | 0.513 | 0.409 | 0.611 | 0.451 |
| 1.595929068023626 | 0.811 | 0.516 | 0.412 | 0.614 | 0.455 |
| 1.599070660677216 | 0.814 | 0.519 | 0.415 | 0.617 | 0.458 |
| 1.602212253330806 | 0.817 | 0.522 | 0.418 | 0.62 | 0.461 |
| 1.605353845984396 | 0.82 | 0.525 | 0.421 | 0.624 | 0.464 |
| 1.608495438637985 | 0.823 | 0.529 | 0.424 | 0.627 | 0.467 |
| 1.611637031291575 | 0.826 | 0.532 | 0.427 | 0.63 | 0.47 |
| 1.614778623945165 | 0.829 | 0.535 | 0.43 | 0.633 | 0.473 |
| 1.617920216598755 | 0.832 | 0.538 | 0.434 | 0.636 | 0.476 |
| 1.621061809252345 | 0.836 | 0.541 | 0.437 | 0.639 | 0.48 |
| 1.624203401905935 | 0.839 | 0.544 | 0.44 | 0.642 | 0.483 |
| 1.627344994559524 | 0.842 | 0.547 | 0.443 | 0.645 | 0.486 |
| 1.630486587213114 | 0.845 | 0.55 | 0.446 | 0.649 | 0.489 |
| 1.633628179866704 | 0.848 | 0.553 | 0.449 | 0.652 | 0.492 |
| 1.636769772520294 | 0.851 | 0.557 | 0.452 | 0.655 | 0.495 |
| 1.639911365173884 | 0.854 | 0.56 | 0.455 | 0.658 | 0.498 |
| 1.643052957827473 | 0.858 | 0.563 | 0.458 | 0.661 | 0.501 |
| 1.646194550481063 | 0.861 | 0.566 | 0.461 | 0.664 | 0.504 |
| 1.649336143134653 | 0.864 | 0.569 | 0.464 | 0.667 | 0.507 |
| 1.652477735788243 | 0.867 | 0.572 | 0.467 | 0.67 | 0.51 |
| 1.655619328441833 | 0.87 | 0.575 | 0.47 | 0.673 | 0.514 |
| 1.658760921095423 | 0.873 | 0.578 | 0.473 | 0.677 | 0.517 |
| 1.661902513749012 | 0.876 | 0.581 | 0.476 | 0.68 | 0.52 |
| 1.665044106402602 | 0.879 | 0.584 | 0.479 | 0.683 | 0.523 |
| 1.668185699056192 | 0.882 | 0.587 | 0.482 | 0.686 | 0.526 |
| 1.671327291709782 | 0.886 | 0.59 | 0.485 | 0.689 | 0.529 |
| 1.674468884363372 | 0.889 | 0.593 | 0.488 | 0.692 | 0.532 |
| 1.677610477016961 | 0.892 | 0.596 | 0.491 | 0.695 | 0.535 |
| 1.680752069670551 | 0.895 | 0.6 | 0.494 | 0.698 | 0.538 |
| 1.683893662324141 | 0.898 | 0.603 | 0.497 | 0.701 | 0.541 |
| 1.687035254977731 | 0.901 | 0.606 | 0.5 | 0.704 | 0.544 |
| 1.690176847631321 | 0.904 | 0.609 | 0.503 | 0.707 | 0.547 |
| 1.693318440284911 | 0.907 | 0.612 | 0.506 | 0.71 | 0.55 |
| 1.6964600329385 | 0.91 | 0.615 | 0.509 | 0.713 | 0.553 |
| 1.69960162559209 | 0.913 | 0.618 | 0.512 | 0.716 | 0.556 |
| 1.70274321824568 | 0.917 | 0.621 | 0.515 | 0.719 | 0.558 |
| 1.70588481089927 | 0.92 | 0.624 | 0.518 | 0.723 | 0.561 |
| 1.70902640355286 | 0.923 | 0.627 | 0.521 | 0.726 | 0.564 |
| 1.712167996206449 | 0.926 | 0.629 | 0.523 | 0.729 | 0.567 |
| 1.715309588860039 | 0.929 | 0.632 | 0.526 | 0.732 | 0.57 |
| 1.71845118151363 | 0.932 | 0.635 | 0.529 | 0.735 | 0.573 |
| 1.721592774167219 | 0.935 | 0.638 | 0.532 | 0.738 | 0.576 |
| 1.724734366820809 | 0.938 | 0.641 | 0.535 | 0.741 | 0.579 |
| 1.727875959474399 | 0.941 | 0.644 | 0.537 | 0.744 | 0.582 |
| 1.731017552127988 | 0.944 | 0.647 | 0.54 | 0.747 | 0.584 |
| 1.734159144781578 | 0.947 | 0.65 | 0.543 | 0.75 | 0.587 |
| 1.737300737435168 | 0.95 | 0.653 | 0.546 | 0.753 | 0.59 |
| 1.740442330088758 | 0.953 | 0.656 | 0.548 | 0.755 | 0.593 |
| 1.743583922742348 | 0.956 | 0.659 | 0.551 | 0.758 | 0.596 |
| 1.746725515395937 | 0.96 | 0.661 | 0.554 | 0.761 | 0.598 |
| 1.749867108049527 | 0.963 | 0.664 | 0.556 | 0.764 | 0.601 |
| 1.753008700703117 | 0.966 | 0.667 | 0.559 | 0.767 | 0.604 |
| 1.756150293356707 | 0.969 | 0.67 | 0.562 | 0.77 | 0.607 |
| 1.759291886010297 | 0.972 | 0.673 | 0.564 | 0.773 | 0.609 |
| 1.762433478663887 | 0.975 | 0.676 | 0.567 | 0.776 | 0.612 |
| 1.765575071317476 | 0.978 | 0.678 | 0.57 | 0.779 | 0.615 |
| 1.768716663971066 | 0.981 | 0.681 | 0.572 | 0.782 | 0.618 |
| 1.771858256624656 | 0.984 | 0.684 | 0.575 | 0.785 | 0.62 |
| 1.774999849278246 | 0.987 | 0.687 | 0.577 | 0.788 | 0.623 |
| 1.778141441931836 | 0.99 | 0.69 | 0.58 | 0.791 | 0.626 |
| 1.781283034585426 | 0.993 | 0.692 | 0.582 | 0.793 | 0.628 |
| 1.784424627239015 | 0.996 | 0.695 | 0.585 | 0.796 | 0.631 |
| 1.787566219892605 | 0.999 | 0.698 | 0.587 | 0.799 | 0.633 |
| 1.790707812546195 | 1.002 | 0.701 | 0.59 | 0.802 | 0.636 |
| 1.793849405199785 | 1.005 | 0.703 | 0.592 | 0.805 | 0.639 |
| 1.796990997853375 | 1.008 | 0.706 | 0.595 | 0.808 | 0.641 |
| 1.800132590506964 | 1.011 | 0.709 | 0.597 | 0.811 | 0.644 |
| 1.803274183160554 | 1.014 | 0.711 | 0.6 | 0.813 | 0.646 |
| 1.806415775814144 | 1.017 | 0.714 | 0.602 | 0.816 | 0.649 |
| 1.809557368467734 | 1.02 | 0.717 | 0.604 | 0.819 | 0.651 |
| 1.812698961121324 | 1.023 | 0.719 | 0.607 | 0.822 | 0.654 |
| 1.815840553774914 | 1.026 | 0.722 | 0.609 | 0.825 | 0.656 |
| 1.818982146428503 | 1.029 | 0.725 | 0.611 | 0.827 | 0.659 |
| 1.822123739082093 | 1.032 | 0.727 | 0.614 | 0.83 | 0.661 |
| 1.825265331735683 | 1.034 | 0.73 | 0.616 | 0.833 | 0.664 |
| 1.828406924389273 | 1.037 | 0.732 | 0.618 | 0.836 | 0.666 |
| 1.831548517042863 | 1.04 | 0.735 | 0.62 | 0.838 | 0.668 |
| 1.834690109696452 | 1.043 | 0.737 | 0.623 | 0.841 | 0.671 |
| 1.837831702350042 | 1.046 | 0.74 | 0.625 | 0.844 | 0.673 |
| 1.840973295003632 | 1.049 | 0.742 | 0.627 | 0.847 | 0.675 |
| 1.844114887657222 | 1.052 | 0.745 | 0.629 | 0.849 | 0.678 |
| 1.847256480310812 | 1.055 | 0.747 | 0.631 | 0.852 | 0.68 |
| 1.850398072964402 | 1.058 | 0.75 | 0.633 | 0.855 | 0.682 |
| 1.853539665617991 | 1.061 | 0.752 | 0.636 | 0.857 | 0.685 |
| 1.856681258271581 | 1.064 | 0.755 | 0.638 | 0.86 | 0.687 |
| 1.859822850925171 | 1.067 | 0.757 | 0.64 | 0.863 | 0.689 |
| 1.862964443578761 | 1.069 | 0.76 | 0.642 | 0.865 | 0.691 |
| 1.866106036232351 | 1.072 | 0.762 | 0.644 | 0.868 | 0.694 |
| 1.86924762888594 | 1.075 | 0.765 | 0.646 | 0.871 | 0.696 |
| 1.87238922153953 | 1.078 | 0.767 | 0.648 | 0.873 | 0.698 |
| 1.87553081419312 | 1.081 | 0.769 | 0.65 | 0.876 | 0.7 |
| 1.87867240684671 | 1.084 | 0.772 | 0.652 | 0.878 | 0.702 |
| 1.8818139995003 | 1.087 | 0.774 | 0.654 | 0.881 | 0.704 |
| 1.88495559215389 | 1.089 | 0.776 | 0.656 | 0.884 | 0.706 |
| 1.888097184807479 | 1.092 | 0.779 | 0.657 | 0.886 | 0.709 |
| 1.891238777461069 | 1.095 | 0.781 | 0.659 | 0.889 | 0.711 |
| 1.89438037011466 | 1.098 | 0.783 | 0.661 | 0.891 | 0.713 |
| 1.897521962768249 | 1.101 | 0.786 | 0.663 | 0.894 | 0.715 |
| 1.900663555421839 | 1.104 | 0.788 | 0.665 | 0.896 | 0.717 |
| 1.903805148075429 | 1.106 | 0.79 | 0.667 | 0.899 | 0.719 |
| 1.906946740729018 | 1.109 | 0.792 | 0.668 | 0.901 | 0.721 |
| 1.910088333382608 | 1.112 | 0.794 | 0.67 | 0.904 | 0.723 |
| 1.913229926036198 | 1.115 | 0.797 | 0.672 | 0.906 | 0.725 |
| 1.916371518689788 | 1.118 | 0.799 | 0.674 | 0.909 | 0.727 |
| 1.919513111343378 | 1.12 | 0.801 | 0.675 | 0.911 | 0.729 |
| 1.922654703996967 | 1.123 | 0.803 | 0.677 | 0.914 | 0.73 |
| 1.925796296650557 | 1.126 | 0.805 | 0.679 | 0.916 | 0.732 |
| 1.928937889304147 | 1.129 | 0.807 | 0.68 | 0.918 | 0.734 |
| 1.932079481957737 | 1.131 | 0.81 | 0.682 | 0.921 | 0.736 |
| 1.935221074611327 | 1.134 | 0.812 | 0.683 | 0.923 | 0.738 |
| 1.938362667264917 | 1.137 | 0.814 | 0.685 | 0.926 | 0.74 |
| 1.941504259918506 | 1.14 | 0.816 | 0.687 | 0.928 | 0.742 |
| 1.944645852572096 | 1.142 | 0.818 | 0.688 | 0.93 | 0.743 |
| 1.947787445225686 | 1.145 | 0.82 | 0.69 | 0.933 | 0.745 |
| 1.950929037879276 | 1.148 | 0.822 | 0.691 | 0.935 | 0.747 |
| 1.954070630532866 | 1.15 | 0.824 | 0.693 | 0.937 | 0.749 |
| 1.957212223186455 | 1.153 | 0.826 | 0.694 | 0.94 | 0.75 |
| 1.960353815840045 | 1.156 | 0.828 | 0.696 | 0.942 | 0.752 |
| 1.963495408493635 | 1.159 | 0.83 | 0.697 | 0.944 | 0.754 |
| 1.966637001147225 | 1.161 | 0.832 | 0.698 | 0.947 | 0.755 |
| 1.969778593800815 | 1.164 | 0.834 | 0.7 | 0.949 | 0.757 |
| 1.972920186454405 | 1.167 | 0.836 | 0.701 | 0.951 | 0.759 |
| 1.976061779107994 | 1.169 | 0.838 | 0.703 | 0.953 | 0.76 |
| 1.979203371761584 | 1.172 | 0.839 | 0.704 | 0.956 | 0.762 |
| 1.982344964415174 | 1.174 | 0.841 | 0.705 | 0.958 | 0.763 |
| 1.985486557068764 | 1.177 | 0.843 | 0.707 | 0.96 | 0.765 |
| 1.988628149722354 | 1.18 | 0.845 | 0.708 | 0.962 | 0.766 |
| 1.991769742375943 | 1.182 | 0.847 | 0.709 | 0.964 | 0.768 |
| 1.994911335029533 | 1.185 | 0.849 | 0.71 | 0.967 | 0.769 |
| 1.998052927683123 | 1.188 | 0.85 | 0.712 | 0.969 | 0.771 |
| 2.001194520336712 | 1.19 | 0.852 | 0.713 | 0.971 | 0.772 |
| 2.004336112990302 | 1.193 | 0.854 | 0.714 | 0.973 | 0.774 |
| 2.007477705643892 | 1.195 | 0.856 | 0.715 | 0.975 | 0.775 |
| 2.010619298297482 | 1.198 | 0.857 | 0.716 | 0.977 | 0.777 |
| 2.013760890951071 | 1.201 | 0.859 | 0.717 | 0.979 | 0.778 |
| 2.016902483604661 | 1.203 | 0.861 | 0.719 | 0.981 | 0.779 |
| 2.02004407625825 | 1.206 | 0.863 | 0.72 | 0.984 | 0.781 |
| 2.02318566891184 | 1.208 | 0.864 | 0.721 | 0.986 | 0.782 |
| 2.02632726156543 | 1.211 | 0.866 | 0.722 | 0.988 | 0.784 |
| 2.029468854219019 | 1.213 | 0.868 | 0.723 | 0.99 | 0.785 |
| 2.032610446872609 | 1.216 | 0.869 | 0.724 | 0.992 | 0.786 |
| 2.035752039526198 | 1.218 | 0.871 | 0.725 | 0.994 | 0.787 |
| 2.038893632179788 | 1.221 | 0.872 | 0.726 | 0.996 | 0.789 |
| 2.042035224833378 | 1.223 | 0.874 | 0.727 | 0.998 | 0.79 |
| 2.045176817486967 | 1.226 | 0.876 | 0.728 | 1 | 0.791 |
| 2.048318410140557 | 1.228 | 0.877 | 0.729 | 1.002 | 0.792 |
| 2.051460002794146 | 1.231 | 0.879 | 0.73 | 1.004 | 0.794 |
| 2.054601595447736 | 1.233 | 0.88 | 0.731 | 1.006 | 0.795 |
| 2.057743188101325 | 1.236 | 0.882 | 0.732 | 1.007 | 0.796 |
| 2.060884780754915 | 1.238 | 0.883 | 0.733 | 1.009 | 0.797 |
| 2.064026373408505 | 1.241 | 0.885 | 0.734 | 1.011 | 0.798 |
| 2.067167966062094 | 1.243 | 0.886 | 0.734 | 1.013 | 0.799 |
| 2.070309558715684 | 1.245 | 0.887 | 0.735 | 1.015 | 0.801 |
| 2.073451151369273 | 1.248 | 0.889 | 0.736 | 1.017 | 0.802 |
| 2.076592744022863 | 1.25 | 0.89 | 0.737 | 1.019 | 0.803 |
| 2.079734336676452 | 1.253 | 0.892 | 0.738 | 1.021 | 0.804 |
| 2.082875929330042 | 1.255 | 0.893 | 0.739 | 1.022 | 0.805 |
| 2.086017521983632 | 1.257 | 0.894 | 0.739 | 1.024 | 0.806 |
| 2.089159114637221 | 1.26 | 0.896 | 0.74 | 1.026 | 0.807 |
| 2.092300707290811 | 1.262 | 0.897 | 0.741 | 1.028 | 0.808 |
| 2.095442299944401 | 1.264 | 0.899 | 0.742 | 1.03 | 0.809 |
| 2.09858389259799 | 1.267 | 0.9 | 0.742 | 1.031 | 0.81 |
| 2.10172548525158 | 1.269 | 0.901 | 0.743 | 1.033 | 0.811 |
| 2.104867077905169 | 1.272 | 0.902 | 0.744 | 1.035 | 0.812 |
| 2.108008670558759 | 1.274 | 0.904 | 0.745 | 1.037 | 0.813 |
| 2.111150263212349 | 1.276 | 0.905 | 0.745 | 1.038 | 0.814 |
| 2.114291855865938 | 1.278 | 0.906 | 0.746 | 1.04 | 0.815 |
| 2.117433448519528 | 1.281 | 0.907 | 0.747 | 1.042 | 0.816 |
| 2.120575041173117 | 1.283 | 0.909 | 0.747 | 1.043 | 0.816 |
| 2.123716633826707 | 1.285 | 0.91 | 0.748 | 1.045 | 0.817 |
| 2.126858226480297 | 1.288 | 0.911 | 0.748 | 1.047 | 0.818 |
| 2.129999819133886 | 1.29 | 0.912 | 0.749 | 1.048 | 0.819 |
| 2.133141411787476 | 1.292 | 0.913 | 0.75 | 1.05 | 0.82 |
| 2.136283004441065 | 1.294 | 0.914 | 0.75 | 1.051 | 0.821 |
| 2.139424597094655 | 1.297 | 0.916 | 0.751 | 1.053 | 0.821 |
| 2.142566189748245 | 1.299 | 0.917 | 0.751 | 1.055 | 0.822 |
| 2.145707782401834 | 1.301 | 0.918 | 0.752 | 1.056 | 0.823 |
| 2.148849375055424 | 1.303 | 0.919 | 0.753 | 1.058 | 0.824 |
| 2.151990967709013 | 1.305 | 0.92 | 0.753 | 1.059 | 0.825 |
| 2.155132560362603 | 1.308 | 0.921 | 0.754 | 1.061 | 0.825 |
| 2.158274153016193 | 1.31 | 0.922 | 0.754 | 1.062 | 0.826 |
| 2.161415745669782 | 1.312 | 0.923 | 0.755 | 1.064 | 0.827 |
| 2.164557338323372 | 1.314 | 0.924 | 0.755 | 1.065 | 0.827 |
| 2.167698930976961 | 1.316 | 0.925 | 0.756 | 1.067 | 0.828 |
| 2.170840523630551 | 1.318 | 0.926 | 0.756 | 1.068 | 0.829 |
| 2.173982116284141 | 1.321 | 0.927 | 0.756 | 1.07 | 0.829 |
| 2.17712370893773 | 1.323 | 0.928 | 0.757 | 1.071 | 0.83 |
| 2.18026530159132 | 1.325 | 0.929 | 0.757 | 1.073 | 0.831 |
| 2.183406894244909 | 1.327 | 0.93 | 0.758 | 1.074 | 0.831 |
| 2.186548486898499 | 1.329 | 0.931 | 0.758 | 1.075 | 0.832 |
| 2.189690079552089 | 1.331 | 0.932 | 0.759 | 1.077 | 0.833 |
| 2.192831672205678 | 1.333 | 0.933 | 0.759 | 1.078 | 0.833 |
| 2.195973264859268 | 1.335 | 0.934 | 0.759 | 1.079 | 0.834 |
| 2.199114857512857 | 1.337 | 0.935 | 0.76 | 1.081 | 0.834 |
| 2.202256450166447 | 1.339 | 0.935 | 0.76 | 1.082 | 0.835 |
| 2.205398042820036 | 1.341 | 0.936 | 0.76 | 1.083 | 0.836 |
| 2.208539635473626 | 1.343 | 0.937 | 0.761 | 1.085 | 0.836 |
| 2.211681228127216 | 1.345 | 0.938 | 0.761 | 1.086 | 0.837 |
| 2.214822820780805 | 1.347 | 0.939 | 0.762 | 1.087 | 0.837 |
| 2.217964413434395 | 1.349 | 0.94 | 0.762 | 1.089 | 0.838 |
| 2.221106006087984 | 1.351 | 0.94 | 0.762 | 1.09 | 0.838 |
| 2.224247598741574 | 1.353 | 0.941 | 0.762 | 1.091 | 0.839 |
| 2.227389191395164 | 1.355 | 0.942 | 0.763 | 1.092 | 0.839 |
| 2.230530784048753 | 1.357 | 0.943 | 0.763 | 1.094 | 0.84 |
| 2.233672376702343 | 1.359 | 0.944 | 0.763 | 1.095 | 0.84 |
| 2.236813969355933 | 1.361 | 0.944 | 0.764 | 1.096 | 0.841 |
| 2.239955562009522 | 1.363 | 0.945 | 0.764 | 1.097 | 0.841 |
| 2.243097154663112 | 1.365 | 0.946 | 0.764 | 1.098 | 0.842 |
| 2.246238747316701 | 1.367 | 0.947 | 0.765 | 1.1 | 0.842 |
| 2.249380339970291 | 1.369 | 0.947 | 0.765 | 1.101 | 0.842 |
| 2.252521932623881 | 1.371 | 0.948 | 0.765 | 1.102 | 0.843 |
| 2.25566352527747 | 1.373 | 0.949 | 0.765 | 1.103 | 0.843 |
| 2.25880511793106 | 1.375 | 0.949 | 0.766 | 1.104 | 0.844 |
| 2.261946710584649 | 1.377 | 0.95 | 0.766 | 1.105 | 0.844 |
| 2.265088303238239 | 1.378 | 0.951 | 0.766 | 1.106 | 0.844 |
| 2.268229895891829 | 1.38 | 0.951 | 0.766 | 1.107 | 0.845 |
| 2.271371488545418 | 1.382 | 0.952 | 0.766 | 1.109 | 0.845 |
| 2.274513081199008 | 1.384 | 0.952 | 0.767 | 1.11 | 0.846 |
| 2.277654673852597 | 1.386 | 0.953 | 0.767 | 1.111 | 0.846 |
| 2.280796266506186 | 1.388 | 0.954 | 0.767 | 1.112 | 0.846 |
| 2.283937859159776 | 1.389 | 0.954 | 0.767 | 1.113 | 0.847 |
| 2.287079451813366 | 1.391 | 0.955 | 0.767 | 1.114 | 0.847 |
| 2.290221044466955 | 1.393 | 0.955 | 0.768 | 1.115 | 0.847 |
| 2.293362637120545 | 1.395 | 0.956 | 0.768 | 1.116 | 0.848 |
| 2.296504229774135 | 1.396 | 0.957 | 0.768 | 1.117 | 0.848 |
| 2.299645822427724 | 1.398 | 0.957 | 0.768 | 1.118 | 0.848 |
| 2.302787415081314 | 1.4 | 0.958 | 0.768 | 1.119 | 0.848 |
| 2.305929007734904 | 1.402 | 0.958 | 0.768 | 1.12 | 0.849 |
| 2.309070600388493 | 1.403 | 0.959 | 0.769 | 1.121 | 0.849 |
| 2.312212193042083 | 1.405 | 0.959 | 0.769 | 1.122 | 0.849 |
| 2.315353785695672 | 1.407 | 0.96 | 0.769 | 1.123 | 0.85 |
| 2.318495378349262 | 1.409 | 0.96 | 0.769 | 1.123 | 0.85 |
| 2.321636971002852 | 1.41 | 0.961 | 0.769 | 1.124 | 0.85 |
| 2.324778563656441 | 1.412 | 0.961 | 0.769 | 1.125 | 0.85 |
| 2.327920156310031 | 1.414 | 0.962 | 0.769 | 1.126 | 0.851 |
| 2.33106174896362 | 1.415 | 0.962 | 0.77 | 1.127 | 0.851 |
| 2.33420334161721 | 1.417 | 0.963 | 0.77 | 1.128 | 0.851 |
| 2.3373449342708 | 1.418 | 0.963 | 0.77 | 1.129 | 0.851 |
| 2.340486526924389 | 1.42 | 0.963 | 0.77 | 1.13 | 0.852 |
| 2.343628119577979 | 1.422 | 0.964 | 0.77 | 1.13 | 0.852 |
| 2.346769712231568 | 1.423 | 0.964 | 0.77 | 1.131 | 0.852 |
| 2.349911304885158 | 1.425 | 0.965 | 0.77 | 1.132 | 0.852 |
| 2.353052897538748 | 1.427 | 0.965 | 0.77 | 1.133 | 0.852 |
| 2.356194490192337 | 1.428 | 0.965 | 0.77 | 1.134 | 0.853 |
| 2.359336082845927 | 1.43 | 0.966 | 0.771 | 1.134 | 0.853 |
| 2.362477675499516 | 1.431 | 0.966 | 0.771 | 1.135 | 0.853 |
| 2.365619268153106 | 1.433 | 0.967 | 0.771 | 1.136 | 0.853 |
| 2.368760860806696 | 1.434 | 0.967 | 0.771 | 1.137 | 0.853 |
| 2.371902453460285 | 1.436 | 0.967 | 0.771 | 1.137 | 0.854 |
| 2.375044046113875 | 1.437 | 0.968 | 0.771 | 1.138 | 0.854 |
| 2.378185638767464 | 1.439 | 0.968 | 0.771 | 1.139 | 0.854 |
| 2.381327231421054 | 1.44 | 0.968 | 0.771 | 1.14 | 0.854 |
| 2.384468824074644 | 1.442 | 0.969 | 0.771 | 1.14 | 0.854 |
| 2.387610416728233 | 1.443 | 0.969 | 0.771 | 1.141 | 0.854 |
| 2.390752009381823 | 1.445 | 0.969 | 0.771 | 1.142 | 0.854 |
| 2.393893602035412 | 1.446 | 0.97 | 0.771 | 1.142 | 0.855 |
| 2.397035194689002 | 1.448 | 0.97 | 0.772 | 1.143 | 0.855 |
| 2.400176787342591 | 1.449 | 0.97 | 0.772 | 1.144 | 0.855 |
| 2.403318379996181 | 1.451 | 0.971 | 0.772 | 1.144 | 0.855 |
| 2.406459972649771 | 1.452 | 0.971 | 0.772 | 1.145 | 0.855 |
| 2.40960156530336 | 1.453 | 0.971 | 0.772 | 1.146 | 0.855 |
| 2.41274315795695 | 1.455 | 0.971 | 0.772 | 1.146 | 0.855 |
| 2.41588475061054 | 1.456 | 0.972 | 0.772 | 1.147 | 0.856 |
| 2.419026343264129 | 1.458 | 0.972 | 0.772 | 1.147 | 0.856 |
| 2.422167935917719 | 1.459 | 0.972 | 0.772 | 1.148 | 0.856 |
| 2.425309528571308 | 1.46 | 0.972 | 0.772 | 1.149 | 0.856 |
| 2.428451121224898 | 1.462 | 0.973 | 0.772 | 1.149 | 0.856 |
| 2.431592713878488 | 1.463 | 0.973 | 0.772 | 1.15 | 0.856 |
| 2.434734306532077 | 1.464 | 0.973 | 0.772 | 1.15 | 0.856 |
| 2.437875899185667 | 1.466 | 0.973 | 0.772 | 1.151 | 0.856 |
| 2.441017491839256 | 1.467 | 0.974 | 0.772 | 1.151 | 0.856 |
| 2.444159084492846 | 1.468 | 0.974 | 0.772 | 1.152 | 0.856 |
| 2.447300677146435 | 1.47 | 0.974 | 0.772 | 1.152 | 0.857 |
| 2.450442269800025 | 1.471 | 0.974 | 0.772 | 1.153 | 0.857 |
| 2.453583862453615 | 1.472 | 0.975 | 0.772 | 1.153 | 0.857 |
| 2.456725455107204 | 1.473 | 0.975 | 0.772 | 1.154 | 0.857 |
| 2.459867047760794 | 1.475 | 0.975 | 0.772 | 1.155 | 0.857 |
| 2.463008640414384 | 1.476 | 0.975 | 0.772 | 1.155 | 0.857 |
| 2.466150233067973 | 1.477 | 0.975 | 0.772 | 1.155 | 0.857 |
| 2.469291825721563 | 1.478 | 0.976 | 0.773 | 1.156 | 0.857 |
| 2.472433418375152 | 1.479 | 0.976 | 0.773 | 1.156 | 0.857 |
| 2.475575011028742 | 1.481 | 0.976 | 0.773 | 1.157 | 0.857 |
| 2.478716603682332 | 1.482 | 0.976 | 0.773 | 1.157 | 0.857 |
| 2.481858196335921 | 1.483 | 0.976 | 0.773 | 1.158 | 0.857 |
| 2.48499978898951 | 1.484 | 0.976 | 0.773 | 1.158 | 0.857 |
| 2.4881413816431 | 1.485 | 0.977 | 0.773 | 1.159 | 0.858 |
| 2.49128297429669 | 1.487 | 0.977 | 0.773 | 1.159 | 0.858 |
| 2.49442456695028 | 1.488 | 0.977 | 0.773 | 1.16 | 0.858 |
| 2.497566159603869 | 1.489 | 0.977 | 0.773 | 1.16 | 0.858 |
| 2.500707752257458 | 1.49 | 0.977 | 0.773 | 1.16 | 0.858 |
| 2.503849344911048 | 1.491 | 0.977 | 0.773 | 1.161 | 0.858 |
| 2.506990937564638 | 1.492 | 0.977 | 0.773 | 1.161 | 0.858 |
| 2.510132530218228 | 1.493 | 0.978 | 0.773 | 1.161 | 0.858 |
| 2.513274122871817 | 1.494 | 0.978 | 0.773 | 1.162 | 0.858 |
| 2.516415715525407 | 1.495 | 0.978 | 0.773 | 1.162 | 0.858 |
| 2.519557308178996 | 1.497 | 0.978 | 0.773 | 1.163 | 0.858 |
| 2.522698900832586 | 1.498 | 0.978 | 0.773 | 1.163 | 0.858 |
| 2.525840493486176 | 1.499 | 0.978 | 0.773 | 1.163 | 0.858 |
| 2.528982086139765 | 1.5 | 0.978 | 0.773 | 1.164 | 0.858 |
| 2.532123678793355 | 1.501 | 0.978 | 0.773 | 1.164 | 0.858 |
| 2.535265271446944 | 1.502 | 0.979 | 0.773 | 1.164 | 0.858 |
| 2.538406864100534 | 1.503 | 0.979 | 0.773 | 1.165 | 0.858 |
| 2.541548456754124 | 1.504 | 0.979 | 0.773 | 1.165 | 0.858 |
| 2.544690049407713 | 1.505 | 0.979 | 0.773 | 1.165 | 0.858 |
| 2.547831642061302 | 1.506 | 0.979 | 0.773 | 1.166 | 0.858 |
| 2.550973234714892 | 1.507 | 0.979 | 0.773 | 1.166 | 0.858 |
| 2.554114827368482 | 1.508 | 0.979 | 0.773 | 1.166 | 0.858 |
| 2.557256420022072 | 1.509 | 0.979 | 0.773 | 1.167 | 0.858 |
| 2.560398012675661 | 1.51 | 0.979 | 0.773 | 1.167 | 0.858 |
| 2.563539605329251 | 1.511 | 0.979 | 0.773 | 1.167 | 0.858 |
| 2.56668119798284 | 1.512 | 0.979 | 0.773 | 1.167 | 0.858 |
| 2.56982279063643 | 1.512 | 0.98 | 0.773 | 1.168 | 0.859 |
| 2.57296438329002 | 1.513 | 0.98 | 0.773 | 1.168 | 0.859 |
| 2.576105975943609 | 1.514 | 0.98 | 0.773 | 1.168 | 0.859 |
| 2.579247568597199 | 1.515 | 0.98 | 0.773 | 1.168 | 0.859 |
| 2.582389161250788 | 1.516 | 0.98 | 0.773 | 1.169 | 0.859 |
| 2.585530753904377 | 1.517 | 0.98 | 0.773 | 1.169 | 0.859 |
| 2.588672346557967 | 1.518 | 0.98 | 0.773 | 1.169 | 0.859 |
| 2.591813939211557 | 1.519 | 0.98 | 0.773 | 1.169 | 0.859 |
| 2.594955531865147 | 1.52 | 0.98 | 0.773 | 1.17 | 0.859 |
| 2.598097124518736 | 1.52 | 0.98 | 0.773 | 1.17 | 0.859 |
| 2.601238717172326 | 1.521 | 0.98 | 0.773 | 1.17 | 0.859 |
| 2.604380309825915 | 1.522 | 0.98 | 0.773 | 1.17 | 0.859 |
| 2.607521902479505 | 1.523 | 0.98 | 0.773 | 1.171 | 0.859 |
| 2.610663495133095 | 1.524 | 0.98 | 0.773 | 1.171 | 0.859 |
| 2.613805087786684 | 1.524 | 0.98 | 0.773 | 1.171 | 0.859 |
| 2.616946680440274 | 1.525 | 0.98 | 0.773 | 1.171 | 0.859 |
| 2.620088273093863 | 1.526 | 0.981 | 0.773 | 1.171 | 0.859 |
| 2.623229865747452 | 1.527 | 0.981 | 0.773 | 1.172 | 0.859 |
| 2.626371458401042 | 1.528 | 0.981 | 0.773 | 1.172 | 0.859 |
| 2.629513051054632 | 1.528 | 0.981 | 0.773 | 1.172 | 0.859 |
| 2.632654643708222 | 1.529 | 0.981 | 0.773 | 1.172 | 0.859 |
| 2.635796236361811 | 1.53 | 0.981 | 0.773 | 1.172 | 0.859 |
| 2.638937829015401 | 1.531 | 0.981 | 0.773 | 1.172 | 0.859 |
| 2.642079421668991 | 1.531 | 0.981 | 0.773 | 1.173 | 0.859 |
| 2.64522101432258 | 1.532 | 0.981 | 0.773 | 1.173 | 0.859 |
| 2.64836260697617 | 1.533 | 0.981 | 0.773 | 1.173 | 0.859 |
| 2.651504199629759 | 1.533 | 0.981 | 0.773 | 1.173 | 0.859 |
| 2.654645792283349 | 1.534 | 0.981 | 0.773 | 1.173 | 0.859 |
| 2.657787384936938 | 1.535 | 0.981 | 0.773 | 1.173 | 0.859 |
| 2.660928977590528 | 1.535 | 0.981 | 0.773 | 1.174 | 0.859 |
| 2.664070570244118 | 1.536 | 0.981 | 0.773 | 1.174 | 0.859 |
| 2.667212162897707 | 1.537 | 0.981 | 0.773 | 1.174 | 0.859 |
| 2.670353755551297 | 1.537 | 0.981 | 0.773 | 1.174 | 0.859 |
| 2.673495348204887 | 1.538 | 0.981 | 0.773 | 1.174 | 0.859 |
| 2.676636940858476 | 1.539 | 0.981 | 0.773 | 1.174 | 0.859 |
| 2.679778533512066 | 1.539 | 0.981 | 0.773 | 1.174 | 0.859 |
| 2.682920126165655 | 1.54 | 0.981 | 0.773 | 1.174 | 0.859 |
| 2.686061718819245 | 1.541 | 0.981 | 0.773 | 1.175 | 0.859 |
| 2.689203311472835 | 1.541 | 0.981 | 0.773 | 1.175 | 0.859 |
| 2.692344904126424 | 1.542 | 0.981 | 0.773 | 1.175 | 0.859 |
| 2.695486496780014 | 1.542 | 0.981 | 0.773 | 1.175 | 0.859 |
| 2.698628089433603 | 1.543 | 0.981 | 0.773 | 1.175 | 0.859 |
| 2.701769682087193 | 1.544 | 0.981 | 0.773 | 1.175 | 0.859 |
| 2.704911274740782 | 1.544 | 0.981 | 0.773 | 1.175 | 0.859 |
| 2.708052867394372 | 1.545 | 0.981 | 0.773 | 1.175 | 0.859 |
| 2.711194460047962 | 1.545 | 0.981 | 0.773 | 1.175 | 0.859 |
| 2.714336052701551 | 1.546 | 0.981 | 0.773 | 1.175 | 0.859 |
| 2.717477645355141 | 1.546 | 0.981 | 0.773 | 1.176 | 0.859 |
| 2.720619238008731 | 1.547 | 0.981 | 0.773 | 1.176 | 0.859 |
| 2.72376083066232 | 1.547 | 0.981 | 0.773 | 1.176 | 0.859 |
| 2.72690242331591 | 1.548 | 0.981 | 0.773 | 1.176 | 0.859 |
| 2.730044015969499 | 1.548 | 0.981 | 0.773 | 1.176 | 0.859 |
| 2.733185608623089 | 1.549 | 0.982 | 0.773 | 1.176 | 0.859 |
| 2.736327201276678 | 1.549 | 0.982 | 0.773 | 1.176 | 0.859 |
| 2.739468793930268 | 1.55 | 0.982 | 0.773 | 1.176 | 0.859 |
| 2.742610386583858 | 1.55 | 0.982 | 0.773 | 1.176 | 0.859 |
| 2.745751979237447 | 1.551 | 0.982 | 0.773 | 1.176 | 0.859 |
| 2.748893571891036 | 1.551 | 0.982 | 0.773 | 1.176 | 0.859 |
| 2.752035164544627 | 1.552 | 0.982 | 0.773 | 1.176 | 0.859 |
| 2.755176757198216 | 1.552 | 0.982 | 0.773 | 1.176 | 0.859 |
| 2.758318349851806 | 1.553 | 0.982 | 0.773 | 1.177 | 0.859 |
| 2.761459942505395 | 1.553 | 0.982 | 0.773 | 1.177 | 0.859 |
| 2.764601535158985 | 1.553 | 0.982 | 0.773 | 1.177 | 0.859 |
| 2.767743127812574 | 1.554 | 0.982 | 0.773 | 1.177 | 0.859 |
| 2.770884720466164 | 1.554 | 0.982 | 0.773 | 1.177 | 0.859 |
| 2.774026313119754 | 1.555 | 0.982 | 0.773 | 1.177 | 0.859 |
| 2.777167905773343 | 1.555 | 0.982 | 0.773 | 1.177 | 0.859 |
| 2.780309498426932 | 1.555 | 0.982 | 0.773 | 1.177 | 0.859 |
| 2.783451091080522 | 1.556 | 0.982 | 0.773 | 1.177 | 0.859 |
| 2.786592683734112 | 1.556 | 0.982 | 0.773 | 1.177 | 0.859 |
| 2.789734276387701 | 1.557 | 0.982 | 0.773 | 1.177 | 0.859 |
| 2.792875869041291 | 1.557 | 0.982 | 0.773 | 1.177 | 0.859 |
| 2.796017461694881 | 1.557 | 0.982 | 0.773 | 1.177 | 0.859 |
| 2.79915905434847 | 1.558 | 0.982 | 0.773 | 1.177 | 0.859 |
| 2.80230064700206 | 1.558 | 0.982 | 0.773 | 1.177 | 0.859 |
| 2.80544223965565 | 1.558 | 0.982 | 0.773 | 1.177 | 0.859 |
| 2.808583832309239 | 1.559 | 0.982 | 0.773 | 1.177 | 0.859 |
| 2.811725424962829 | 1.559 | 0.982 | 0.773 | 1.177 | 0.859 |
| 2.814867017616419 | 1.559 | 0.982 | 0.773 | 1.177 | 0.859 |
| 2.818008610270008 | 1.56 | 0.982 | 0.773 | 1.177 | 0.859 |
| 2.821150202923598 | 1.56 | 0.982 | 0.773 | 1.177 | 0.859 |
| 2.824291795577187 | 1.56 | 0.982 | 0.773 | 1.177 | 0.859 |
| 2.827433388230777 | 1.561 | 0.982 | 0.773 | 1.178 | 0.859 |
| 2.830574980884366 | 1.561 | 0.982 | 0.773 | 1.178 | 0.859 |
| 2.833716573537956 | 1.561 | 0.982 | 0.773 | 1.178 | 0.859 |
| 2.836858166191546 | 1.562 | 0.982 | 0.773 | 1.178 | 0.859 |
| 2.839999758845135 | 1.562 | 0.982 | 0.773 | 1.178 | 0.859 |
| 2.843141351498725 | 1.562 | 0.982 | 0.773 | 1.178 | 0.859 |
| 2.846282944152314 | 1.562 | 0.982 | 0.773 | 1.178 | 0.859 |
| 2.849424536805904 | 1.563 | 0.982 | 0.773 | 1.178 | 0.859 |
| 2.852566129459494 | 1.563 | 0.982 | 0.773 | 1.178 | 0.859 |
| 2.855707722113083 | 1.563 | 0.982 | 0.773 | 1.178 | 0.859 |
| 2.858849314766673 | 1.563 | 0.982 | 0.773 | 1.178 | 0.859 |
| 2.861990907420262 | 1.564 | 0.982 | 0.773 | 1.178 | 0.859 |
| 2.865132500073852 | 1.564 | 0.982 | 0.773 | 1.178 | 0.859 |
| 2.868274092727442 | 1.564 | 0.982 | 0.773 | 1.178 | 0.859 |
| 2.871415685381031 | 1.564 | 0.982 | 0.773 | 1.178 | 0.859 |
| 2.874557278034621 | 1.565 | 0.982 | 0.773 | 1.178 | 0.859 |
| 2.87769887068821 | 1.565 | 0.982 | 0.773 | 1.178 | 0.859 |
| 2.8808404633418 | 1.565 | 0.982 | 0.773 | 1.178 | 0.859 |
| 2.88398205599539 | 1.565 | 0.982 | 0.773 | 1.178 | 0.859 |
| 2.88712364864898 | 1.565 | 0.982 | 0.773 | 1.178 | 0.859 |
| 2.890265241302569 | 1.566 | 0.982 | 0.773 | 1.178 | 0.859 |
| 2.893406833956158 | 1.566 | 0.982 | 0.773 | 1.178 | 0.859 |
| 2.896548426609748 | 1.566 | 0.982 | 0.773 | 1.178 | 0.859 |
| 2.899690019263338 | 1.566 | 0.982 | 0.773 | 1.178 | 0.859 |
| 2.902831611916927 | 1.566 | 0.982 | 0.773 | 1.178 | 0.859 |
| 2.905973204570517 | 1.566 | 0.982 | 0.773 | 1.178 | 0.859 |
| 2.909114797224106 | 1.567 | 0.982 | 0.773 | 1.178 | 0.859 |
| 2.912256389877696 | 1.567 | 0.982 | 0.773 | 1.178 | 0.859 |
| 2.915397982531286 | 1.567 | 0.982 | 0.773 | 1.178 | 0.859 |
| 2.918539575184875 | 1.567 | 0.982 | 0.773 | 1.178 | 0.859 |
| 2.921681167838465 | 1.567 | 0.982 | 0.773 | 1.178 | 0.859 |
| 2.924822760492054 | 1.567 | 0.982 | 0.773 | 1.178 | 0.859 |
| 2.927964353145644 | 1.568 | 0.982 | 0.773 | 1.178 | 0.859 |
| 2.931105945799234 | 1.568 | 0.982 | 0.773 | 1.178 | 0.859 |
| 2.934247538452823 | 1.568 | 0.982 | 0.773 | 1.178 | 0.859 |
| 2.937389131106413 | 1.568 | 0.982 | 0.773 | 1.178 | 0.859 |
| 2.940530723760002 | 1.568 | 0.982 | 0.773 | 1.178 | 0.859 |
| 2.943672316413592 | 1.568 | 0.982 | 0.773 | 1.178 | 0.859 |
| 2.946813909067182 | 1.568 | 0.982 | 0.773 | 1.178 | 0.859 |
| 2.949955501720771 | 1.568 | 0.982 | 0.773 | 1.178 | 0.859 |
| 2.953097094374361 | 1.569 | 0.982 | 0.773 | 1.178 | 0.859 |
| 2.95623868702795 | 1.569 | 0.982 | 0.773 | 1.178 | 0.859 |
| 2.95938027968154 | 1.569 | 0.982 | 0.773 | 1.178 | 0.859 |
| 2.96252187233513 | 1.569 | 0.982 | 0.773 | 1.178 | 0.859 |
| 2.965663464988719 | 1.569 | 0.982 | 0.773 | 1.178 | 0.859 |
| 2.968805057642309 | 1.569 | 0.982 | 0.773 | 1.178 | 0.859 |
| 2.971946650295898 | 1.569 | 0.982 | 0.773 | 1.178 | 0.859 |
| 2.975088242949488 | 1.569 | 0.982 | 0.773 | 1.178 | 0.859 |
| 2.978229835603078 | 1.569 | 0.982 | 0.773 | 1.178 | 0.859 |
| 2.981371428256667 | 1.569 | 0.982 | 0.773 | 1.178 | 0.859 |
| 2.984513020910257 | 1.57 | 0.982 | 0.773 | 1.178 | 0.859 |
| 2.987654613563846 | 1.57 | 0.982 | 0.773 | 1.178 | 0.859 |
| 2.990796206217436 | 1.57 | 0.982 | 0.773 | 1.178 | 0.859 |
| 2.993937798871025 | 1.57 | 0.982 | 0.773 | 1.178 | 0.859 |
| 2.997079391524615 | 1.57 | 0.982 | 0.773 | 1.178 | 0.859 |
| 3.000220984178205 | 1.57 | 0.982 | 0.773 | 1.178 | 0.859 |
| 3.003362576831794 | 1.57 | 0.982 | 0.773 | 1.178 | 0.859 |
| 3.006504169485384 | 1.57 | 0.982 | 0.773 | 1.178 | 0.859 |
| 3.009645762138974 | 1.57 | 0.982 | 0.773 | 1.178 | 0.859 |
| 3.012787354792563 | 1.57 | 0.982 | 0.773 | 1.178 | 0.859 |
| 3.015928947446153 | 1.57 | 0.982 | 0.773 | 1.178 | 0.859 |
| 3.019070540099742 | 1.57 | 0.982 | 0.773 | 1.178 | 0.859 |
| 3.022212132753332 | 1.57 | 0.982 | 0.773 | 1.178 | 0.859 |
| 3.025353725406922 | 1.57 | 0.982 | 0.773 | 1.178 | 0.859 |
| 3.028495318060511 | 1.57 | 0.982 | 0.773 | 1.178 | 0.859 |
| 3.031636910714101 | 1.57 | 0.982 | 0.773 | 1.178 | 0.859 |
| 3.03477850336769 | 1.57 | 0.982 | 0.773 | 1.178 | 0.859 |
| 3.03792009602128 | 1.57 | 0.982 | 0.773 | 1.178 | 0.859 |
| 3.04106168867487 | 1.57 | 0.982 | 0.773 | 1.178 | 0.859 |
| 3.04420328132846 | 1.57 | 0.982 | 0.773 | 1.178 | 0.859 |
| 3.047344873982049 | 1.571 | 0.982 | 0.773 | 1.178 | 0.859 |
| 3.050486466635638 | 1.571 | 0.982 | 0.773 | 1.178 | 0.859 |
| 3.053628059289228 | 1.571 | 0.982 | 0.773 | 1.178 | 0.859 |
| 3.056769651942818 | 1.571 | 0.982 | 0.773 | 1.178 | 0.859 |
| 3.059911244596407 | 1.571 | 0.982 | 0.773 | 1.178 | 0.859 |
| 3.063052837249997 | 1.571 | 0.982 | 0.773 | 1.178 | 0.859 |
| 3.066194429903586 | 1.571 | 0.982 | 0.773 | 1.178 | 0.859 |
| 3.069336022557176 | 1.571 | 0.982 | 0.773 | 1.178 | 0.859 |
| 3.072477615210766 | 1.571 | 0.982 | 0.773 | 1.178 | 0.859 |
| 3.075619207864355 | 1.571 | 0.982 | 0.773 | 1.178 | 0.859 |
| 3.078760800517945 | 1.571 | 0.982 | 0.773 | 1.178 | 0.859 |
| 3.081902393171534 | 1.571 | 0.982 | 0.773 | 1.178 | 0.859 |
| 3.085043985825124 | 1.571 | 0.982 | 0.773 | 1.178 | 0.859 |
| 3.088185578478713 | 1.571 | 0.982 | 0.773 | 1.178 | 0.859 |
| 3.091327171132303 | 1.571 | 0.982 | 0.773 | 1.178 | 0.859 |
| 3.094468763785893 | 1.571 | 0.982 | 0.773 | 1.178 | 0.859 |
| 3.097610356439482 | 1.571 | 0.982 | 0.773 | 1.178 | 0.859 |
| 3.100751949093072 | 1.571 | 0.982 | 0.773 | 1.178 | 0.859 |
| 3.103893541746661 | 1.571 | 0.982 | 0.773 | 1.178 | 0.859 |
| 3.107035134400251 | 1.571 | 0.982 | 0.773 | 1.178 | 0.859 |
| 3.110176727053841 | 1.571 | 0.982 | 0.773 | 1.178 | 0.859 |
| 3.11331831970743 | 1.571 | 0.982 | 0.773 | 1.178 | 0.859 |
| 3.11645991236102 | 1.571 | 0.982 | 0.773 | 1.178 | 0.859 |
| 3.11960150501461 | 1.571 | 0.982 | 0.773 | 1.178 | 0.859 |
| 3.122743097668199 | 1.571 | 0.982 | 0.773 | 1.178 | 0.859 |
| 3.125884690321789 | 1.571 | 0.982 | 0.773 | 1.178 | 0.859 |
| 3.129026282975378 | 1.571 | 0.982 | 0.773 | 1.178 | 0.859 |
| 3.132167875628968 | 1.571 | 0.982 | 0.773 | 1.178 | 0.859 |
| 3.135309468282557 | 1.571 | 0.982 | 0.773 | 1.178 | 0.859 |
| 3.138451060936147 | 1.571 | 0.982 | 0.773 | 1.178 | 0.859 |
| 3.141592653589737 | 1.571 | 0.982 | 0.773 | 1.178 | 0.859 |
| 3.144734246243326 | 1.571 | 0.982 | 0.773 | 1.178 | 0.859 |
| 3.147875838896916 | 1.571 | 0.982 | 0.773 | 1.178 | 0.859 |
| 3.151017431550505 | 1.571 | 0.982 | 0.773 | 1.178 | 0.859 |
| 3.154159024204095 | 1.571 | 0.982 | 0.773 | 1.178 | 0.859 |
| 3.157300616857685 | 1.571 | 0.982 | 0.773 | 1.178 | 0.859 |
| 3.160442209511274 | 1.571 | 0.982 | 0.773 | 1.178 | 0.859 |
| 3.163583802164864 | 1.571 | 0.982 | 0.773 | 1.178 | 0.859 |
| 3.166725394818453 | 1.571 | 0.982 | 0.773 | 1.178 | 0.859 |
| 3.169866987472043 | 1.571 | 0.982 | 0.773 | 1.178 | 0.859 |
| 3.173008580125633 | 1.571 | 0.982 | 0.773 | 1.178 | 0.859 |
| 3.176150172779222 | 1.571 | 0.982 | 0.773 | 1.178 | 0.859 |
| 3.179291765432812 | 1.571 | 0.982 | 0.773 | 1.178 | 0.859 |
| 3.182433358086401 | 1.571 | 0.982 | 0.773 | 1.178 | 0.859 |
| 3.185574950739991 | 1.571 | 0.982 | 0.773 | 1.178 | 0.859 |
| 3.188716543393581 | 1.571 | 0.982 | 0.773 | 1.178 | 0.859 |
| 3.19185813604717 | 1.571 | 0.982 | 0.773 | 1.178 | 0.859 |
| 3.19499972870076 | 1.571 | 0.982 | 0.773 | 1.178 | 0.859 |
| 3.198141321354349 | 1.571 | 0.982 | 0.773 | 1.178 | 0.859 |
| 3.20128291400794 | 1.571 | 0.982 | 0.773 | 1.178 | 0.859 |
| 3.204424506661528 | 1.571 | 0.982 | 0.773 | 1.178 | 0.859 |
| 3.207566099315118 | 1.571 | 0.982 | 0.773 | 1.178 | 0.859 |
| 3.210707691968708 | 1.571 | 0.982 | 0.773 | 1.178 | 0.859 |
| 3.213849284622297 | 1.571 | 0.982 | 0.773 | 1.178 | 0.859 |
| 3.216990877275887 | 1.571 | 0.982 | 0.773 | 1.178 | 0.859 |
| 3.220132469929476 | 1.571 | 0.982 | 0.773 | 1.178 | 0.859 |
| 3.223274062583066 | 1.571 | 0.982 | 0.773 | 1.178 | 0.859 |
| 3.226415655236656 | 1.571 | 0.982 | 0.773 | 1.178 | 0.859 |
| 3.229557247890245 | 1.571 | 0.982 | 0.773 | 1.178 | 0.859 |
| 3.232698840543835 | 1.571 | 0.982 | 0.773 | 1.178 | 0.859 |
| 3.235840433197425 | 1.571 | 0.982 | 0.773 | 1.178 | 0.859 |
| 3.238982025851014 | 1.571 | 0.982 | 0.773 | 1.178 | 0.859 |
| 3.242123618504604 | 1.571 | 0.982 | 0.773 | 1.178 | 0.859 |
| 3.245265211158193 | 1.571 | 0.982 | 0.773 | 1.178 | 0.859 |
| 3.248406803811783 | 1.571 | 0.982 | 0.773 | 1.178 | 0.859 |
| 3.251548396465373 | 1.571 | 0.982 | 0.773 | 1.178 | 0.859 |
| 3.254689989118962 | 1.571 | 0.982 | 0.773 | 1.178 | 0.859 |
| 3.257831581772551 | 1.571 | 0.982 | 0.773 | 1.178 | 0.859 |
| 3.260973174426141 | 1.571 | 0.982 | 0.773 | 1.178 | 0.859 |
| 3.26411476707973 | 1.571 | 0.982 | 0.773 | 1.178 | 0.859 |
| 3.267256359733321 | 1.571 | 0.982 | 0.773 | 1.178 | 0.859 |
| 3.27039795238691 | 1.572 | 0.982 | 0.773 | 1.178 | 0.859 |
| 3.2735395450405 | 1.572 | 0.982 | 0.773 | 1.178 | 0.859 |
| 3.276681137694089 | 1.572 | 0.982 | 0.773 | 1.178 | 0.859 |
| 3.279822730347679 | 1.572 | 0.982 | 0.773 | 1.178 | 0.859 |
| 3.282964323001269 | 1.572 | 0.982 | 0.773 | 1.178 | 0.859 |
| 3.286105915654858 | 1.572 | 0.982 | 0.773 | 1.178 | 0.859 |
| 3.289247508308448 | 1.572 | 0.982 | 0.773 | 1.178 | 0.859 |
| 3.292389100962037 | 1.572 | 0.982 | 0.773 | 1.178 | 0.859 |
| 3.295530693615627 | 1.572 | 0.982 | 0.773 | 1.178 | 0.859 |
| 3.298672286269217 | 1.572 | 0.982 | 0.773 | 1.178 | 0.859 |
| 3.301813878922806 | 1.572 | 0.982 | 0.773 | 1.178 | 0.859 |
| 3.304955471576396 | 1.572 | 0.982 | 0.773 | 1.178 | 0.859 |
| 3.308097064229985 | 1.572 | 0.982 | 0.773 | 1.178 | 0.859 |
| 3.311238656883575 | 1.572 | 0.982 | 0.773 | 1.178 | 0.859 |
| 3.314380249537165 | 1.573 | 0.982 | 0.773 | 1.178 | 0.859 |
| 3.317521842190754 | 1.573 | 0.982 | 0.773 | 1.178 | 0.859 |
| 3.320663434844344 | 1.573 | 0.982 | 0.773 | 1.178 | 0.859 |
| 3.323805027497933 | 1.573 | 0.982 | 0.773 | 1.178 | 0.859 |
| 3.326946620151523 | 1.573 | 0.982 | 0.773 | 1.178 | 0.859 |
| 3.330088212805113 | 1.573 | 0.982 | 0.773 | 1.178 | 0.859 |
| 3.333229805458702 | 1.573 | 0.982 | 0.773 | 1.178 | 0.859 |
| 3.336371398112292 | 1.573 | 0.982 | 0.773 | 1.178 | 0.859 |
| 3.339512990765881 | 1.573 | 0.982 | 0.773 | 1.178 | 0.859 |
| 3.342654583419471 | 1.573 | 0.982 | 0.773 | 1.178 | 0.859 |
| 3.345796176073061 | 1.574 | 0.982 | 0.773 | 1.178 | 0.859 |
| 3.34893776872665 | 1.574 | 0.982 | 0.773 | 1.178 | 0.859 |
| 3.35207936138024 | 1.574 | 0.982 | 0.773 | 1.178 | 0.859 |
| 3.355220954033829 | 1.574 | 0.982 | 0.773 | 1.178 | 0.859 |
| 3.358362546687419 | 1.574 | 0.982 | 0.773 | 1.178 | 0.859 |
| 3.361504139341009 | 1.574 | 0.982 | 0.773 | 1.178 | 0.859 |
| 3.364645731994598 | 1.574 | 0.982 | 0.773 | 1.178 | 0.859 |
| 3.367787324648188 | 1.575 | 0.982 | 0.773 | 1.178 | 0.859 |
| 3.370928917301777 | 1.575 | 0.982 | 0.773 | 1.178 | 0.859 |
| 3.374070509955367 | 1.575 | 0.982 | 0.773 | 1.178 | 0.859 |
| 3.377212102608956 | 1.575 | 0.982 | 0.773 | 1.178 | 0.859 |
| 3.380353695262546 | 1.575 | 0.982 | 0.773 | 1.178 | 0.859 |
| 3.383495287916136 | 1.575 | 0.982 | 0.773 | 1.178 | 0.859 |
| 3.386636880569725 | 1.576 | 0.982 | 0.773 | 1.178 | 0.859 |
| 3.389778473223315 | 1.576 | 0.982 | 0.773 | 1.178 | 0.859 |
| 3.392920065876904 | 1.576 | 0.982 | 0.773 | 1.178 | 0.859 |
| 3.396061658530494 | 1.576 | 0.982 | 0.773 | 1.178 | 0.859 |
| 3.399203251184084 | 1.576 | 0.982 | 0.773 | 1.178 | 0.859 |
| 3.402344843837673 | 1.577 | 0.982 | 0.773 | 1.178 | 0.859 |
| 3.405486436491263 | 1.577 | 0.982 | 0.773 | 1.178 | 0.859 |
| 3.408628029144852 | 1.577 | 0.982 | 0.773 | 1.178 | 0.859 |
| 3.411769621798442 | 1.577 | 0.982 | 0.773 | 1.178 | 0.859 |
| 3.414911214452032 | 1.578 | 0.982 | 0.773 | 1.178 | 0.859 |
| 3.418052807105621 | 1.578 | 0.982 | 0.773 | 1.178 | 0.859 |
| 3.421194399759211 | 1.578 | 0.982 | 0.773 | 1.178 | 0.859 |
| 3.4243359924128 | 1.578 | 0.982 | 0.773 | 1.178 | 0.859 |
| 3.42747758506639 | 1.578 | 0.982 | 0.773 | 1.178 | 0.859 |
| 3.43061917771998 | 1.579 | 0.982 | 0.773 | 1.178 | 0.859 |
| 3.433760770373569 | 1.579 | 0.982 | 0.773 | 1.179 | 0.859 |
| 3.436902363027159 | 1.579 | 0.982 | 0.773 | 1.179 | 0.859 |
| 3.440043955680748 | 1.58 | 0.982 | 0.773 | 1.179 | 0.859 |
| 3.443185548334338 | 1.58 | 0.982 | 0.773 | 1.179 | 0.859 |
| 3.446327140987927 | 1.58 | 0.982 | 0.773 | 1.179 | 0.859 |
| 3.449468733641517 | 1.58 | 0.982 | 0.773 | 1.179 | 0.859 |
| 3.452610326295107 | 1.581 | 0.982 | 0.773 | 1.179 | 0.859 |
| 3.455751918948696 | 1.581 | 0.982 | 0.773 | 1.179 | 0.859 |
| 3.458893511602286 | 1.581 | 0.982 | 0.773 | 1.179 | 0.859 |
| 3.462035104255876 | 1.582 | 0.982 | 0.773 | 1.179 | 0.859 |
| 3.465176696909465 | 1.582 | 0.982 | 0.773 | 1.179 | 0.859 |
| 3.468318289563055 | 1.582 | 0.982 | 0.773 | 1.179 | 0.859 |
| 3.471459882216644 | 1.583 | 0.982 | 0.773 | 1.179 | 0.859 |
| 3.474601474870234 | 1.583 | 0.982 | 0.773 | 1.179 | 0.859 |
| 3.477743067523824 | 1.583 | 0.982 | 0.773 | 1.179 | 0.859 |
| 3.480884660177413 | 1.584 | 0.982 | 0.773 | 1.179 | 0.859 |
| 3.484026252831002 | 1.584 | 0.982 | 0.773 | 1.179 | 0.859 |
| 3.487167845484592 | 1.584 | 0.982 | 0.773 | 1.179 | 0.859 |
| 3.490309438138182 | 1.585 | 0.982 | 0.773 | 1.179 | 0.859 |
| 3.493451030791772 | 1.585 | 0.982 | 0.773 | 1.179 | 0.859 |
| 3.496592623445361 | 1.585 | 0.982 | 0.773 | 1.179 | 0.859 |
| 3.499734216098951 | 1.586 | 0.982 | 0.773 | 1.179 | 0.859 |
| 3.50287580875254 | 1.586 | 0.982 | 0.773 | 1.179 | 0.859 |
| 3.50601740140613 | 1.587 | 0.982 | 0.773 | 1.179 | 0.859 |
| 3.50915899405972 | 1.587 | 0.982 | 0.773 | 1.179 | 0.859 |
| 3.512300586713309 | 1.587 | 0.982 | 0.773 | 1.179 | 0.859 |
| 3.515442179366899 | 1.588 | 0.982 | 0.773 | 1.179 | 0.859 |
| 3.518583772020488 | 1.588 | 0.982 | 0.773 | 1.18 | 0.859 |
| 3.521725364674078 | 1.589 | 0.982 | 0.773 | 1.18 | 0.859 |
| 3.524866957327668 | 1.589 | 0.982 | 0.773 | 1.18 | 0.859 |
| 3.528008549981257 | 1.589 | 0.982 | 0.773 | 1.18 | 0.859 |
| 3.531150142634847 | 1.59 | 0.982 | 0.773 | 1.18 | 0.859 |
| 3.534291735288436 | 1.59 | 0.982 | 0.773 | 1.18 | 0.859 |
| 3.537433327942026 | 1.591 | 0.982 | 0.773 | 1.18 | 0.859 |
| 3.540574920595616 | 1.591 | 0.982 | 0.773 | 1.18 | 0.859 |
| 3.543716513249205 | 1.592 | 0.982 | 0.773 | 1.18 | 0.859 |
| 3.546858105902795 | 1.592 | 0.982 | 0.773 | 1.18 | 0.859 |
| 3.549999698556384 | 1.593 | 0.982 | 0.773 | 1.18 | 0.859 |
| 3.553141291209974 | 1.593 | 0.982 | 0.773 | 1.18 | 0.859 |
| 3.556282883863564 | 1.594 | 0.982 | 0.773 | 1.18 | 0.859 |
| 3.559424476517153 | 1.594 | 0.982 | 0.773 | 1.18 | 0.859 |
| 3.562566069170743 | 1.595 | 0.982 | 0.773 | 1.181 | 0.859 |
| 3.565707661824332 | 1.595 | 0.982 | 0.773 | 1.181 | 0.859 |
| 3.568849254477922 | 1.596 | 0.982 | 0.773 | 1.181 | 0.859 |
| 3.571990847131511 | 1.596 | 0.982 | 0.773 | 1.181 | 0.859 |
| 3.575132439785101 | 1.597 | 0.982 | 0.773 | 1.181 | 0.859 |
| 3.578274032438691 | 1.598 | 0.982 | 0.773 | 1.181 | 0.859 |
| 3.58141562509228 | 1.598 | 0.982 | 0.773 | 1.181 | 0.859 |
| 3.58455721774587 | 1.599 | 0.982 | 0.773 | 1.181 | 0.859 |
| 3.58769881039946 | 1.599 | 0.982 | 0.773 | 1.181 | 0.859 |
| 3.590840403053049 | 1.6 | 0.982 | 0.773 | 1.181 | 0.859 |
| 3.593981995706639 | 1.6 | 0.982 | 0.773 | 1.182 | 0.859 |
| 3.597123588360228 | 1.601 | 0.982 | 0.773 | 1.182 | 0.859 |
| 3.600265181013818 | 1.602 | 0.982 | 0.773 | 1.182 | 0.859 |
| 3.603406773667407 | 1.602 | 0.982 | 0.773 | 1.182 | 0.859 |
| 3.606548366320997 | 1.603 | 0.982 | 0.773 | 1.182 | 0.859 |
| 3.609689958974587 | 1.604 | 0.982 | 0.773 | 1.182 | 0.859 |
| 3.612831551628176 | 1.604 | 0.982 | 0.773 | 1.182 | 0.859 |
| 3.615973144281766 | 1.605 | 0.982 | 0.773 | 1.182 | 0.859 |
| 3.619114736935355 | 1.605 | 0.982 | 0.773 | 1.183 | 0.859 |
| 3.622256329588945 | 1.606 | 0.982 | 0.773 | 1.183 | 0.859 |
| 3.625397922242534 | 1.607 | 0.982 | 0.773 | 1.183 | 0.859 |
| 3.628539514896124 | 1.607 | 0.983 | 0.773 | 1.183 | 0.859 |
| 3.631681107549714 | 1.608 | 0.983 | 0.773 | 1.183 | 0.859 |
| 3.634822700203303 | 1.609 | 0.983 | 0.773 | 1.183 | 0.859 |
| 3.637964292856893 | 1.61 | 0.983 | 0.773 | 1.183 | 0.859 |
| 3.641105885510483 | 1.61 | 0.983 | 0.773 | 1.184 | 0.859 |
| 3.644247478164072 | 1.611 | 0.983 | 0.773 | 1.184 | 0.859 |
| 3.647389070817662 | 1.612 | 0.983 | 0.773 | 1.184 | 0.859 |
| 3.650530663471251 | 1.613 | 0.983 | 0.773 | 1.184 | 0.859 |
| 3.653672256124841 | 1.613 | 0.983 | 0.773 | 1.184 | 0.859 |
| 3.656813848778431 | 1.614 | 0.983 | 0.773 | 1.184 | 0.859 |
| 3.65995544143202 | 1.615 | 0.983 | 0.773 | 1.185 | 0.859 |
| 3.66309703408561 | 1.616 | 0.983 | 0.773 | 1.185 | 0.859 |
| 3.666238626739199 | 1.616 | 0.983 | 0.773 | 1.185 | 0.859 |
| 3.66938021939279 | 1.617 | 0.983 | 0.773 | 1.185 | 0.859 |
| 3.672521812046378 | 1.618 | 0.983 | 0.773 | 1.185 | 0.859 |
| 3.675663404699968 | 1.619 | 0.983 | 0.773 | 1.186 | 0.859 |
| 3.678804997353558 | 1.62 | 0.983 | 0.773 | 1.186 | 0.859 |
| 3.681946590007147 | 1.62 | 0.983 | 0.773 | 1.186 | 0.859 |
| 3.685088182660737 | 1.621 | 0.983 | 0.773 | 1.186 | 0.859 |
| 3.688229775314326 | 1.622 | 0.983 | 0.773 | 1.187 | 0.859 |
| 3.691371367967916 | 1.623 | 0.983 | 0.773 | 1.187 | 0.859 |
| 3.694512960621506 | 1.624 | 0.984 | 0.773 | 1.187 | 0.859 |
| 3.697654553275095 | 1.625 | 0.984 | 0.773 | 1.187 | 0.859 |
| 3.700796145928685 | 1.626 | 0.984 | 0.773 | 1.188 | 0.859 |
| 3.703937738582274 | 1.626 | 0.984 | 0.773 | 1.188 | 0.859 |
| 3.707079331235864 | 1.627 | 0.984 | 0.773 | 1.188 | 0.859 |
| 3.710220923889454 | 1.628 | 0.984 | 0.773 | 1.188 | 0.86 |
| 3.713362516543043 | 1.629 | 0.984 | 0.773 | 1.189 | 0.86 |
| 3.716504109196633 | 1.63 | 0.984 | 0.773 | 1.189 | 0.86 |
| 3.719645701850223 | 1.631 | 0.984 | 0.773 | 1.189 | 0.86 |
| 3.722787294503812 | 1.632 | 0.984 | 0.773 | 1.189 | 0.86 |
| 3.725928887157402 | 1.633 | 0.984 | 0.773 | 1.19 | 0.86 |
| 3.729070479810991 | 1.634 | 0.984 | 0.773 | 1.19 | 0.86 |
| 3.732212072464581 | 1.635 | 0.984 | 0.773 | 1.19 | 0.86 |
| 3.735353665118171 | 1.636 | 0.985 | 0.773 | 1.191 | 0.86 |
| 3.73849525777176 | 1.637 | 0.985 | 0.773 | 1.191 | 0.86 |
| 3.74163685042535 | 1.638 | 0.985 | 0.773 | 1.191 | 0.86 |
| 3.744778443078939 | 1.639 | 0.985 | 0.773 | 1.192 | 0.86 |
| 3.747920035732529 | 1.64 | 0.985 | 0.773 | 1.192 | 0.86 |
| 3.751061628386119 | 1.641 | 0.985 | 0.773 | 1.192 | 0.86 |
| 3.754203221039708 | 1.642 | 0.985 | 0.773 | 1.193 | 0.86 |
| 3.757344813693298 | 1.643 | 0.985 | 0.773 | 1.193 | 0.86 |
| 3.760486406346887 | 1.644 | 0.985 | 0.773 | 1.193 | 0.86 |
| 3.763627999000477 | 1.645 | 0.986 | 0.773 | 1.194 | 0.86 |
| 3.766769591654067 | 1.646 | 0.986 | 0.773 | 1.194 | 0.86 |
| 3.769911184307656 | 1.647 | 0.986 | 0.773 | 1.194 | 0.86 |
| 3.773052776961246 | 1.648 | 0.986 | 0.773 | 1.195 | 0.86 |
| 3.776194369614835 | 1.649 | 0.986 | 0.773 | 1.195 | 0.86 |
| 3.779335962268425 | 1.65 | 0.986 | 0.773 | 1.195 | 0.86 |
| 3.782477554922014 | 1.652 | 0.986 | 0.774 | 1.196 | 0.86 |
| 3.785619147575604 | 1.653 | 0.986 | 0.774 | 1.196 | 0.86 |
| 3.788760740229193 | 1.654 | 0.987 | 0.774 | 1.197 | 0.86 |
| 3.791902332882783 | 1.655 | 0.987 | 0.774 | 1.197 | 0.86 |
| 3.795043925536373 | 1.656 | 0.987 | 0.774 | 1.198 | 0.861 |
| 3.798185518189962 | 1.657 | 0.987 | 0.774 | 1.198 | 0.861 |
| 3.801327110843552 | 1.659 | 0.987 | 0.774 | 1.198 | 0.861 |
| 3.804468703497142 | 1.66 | 0.987 | 0.774 | 1.199 | 0.861 |
| 3.807610296150731 | 1.661 | 0.988 | 0.774 | 1.199 | 0.861 |
| 3.810751888804321 | 1.662 | 0.988 | 0.774 | 1.2 | 0.861 |
| 3.813893481457911 | 1.663 | 0.988 | 0.774 | 1.2 | 0.861 |
| 3.8170350741115 | 1.665 | 0.988 | 0.774 | 1.201 | 0.861 |
| 3.82017666676509 | 1.666 | 0.988 | 0.774 | 1.201 | 0.861 |
| 3.823318259418679 | 1.667 | 0.989 | 0.774 | 1.202 | 0.861 |
| 3.826459852072269 | 1.668 | 0.989 | 0.774 | 1.202 | 0.861 |
| 3.829601444725859 | 1.67 | 0.989 | 0.774 | 1.203 | 0.861 |
| 3.832743037379448 | 1.671 | 0.989 | 0.774 | 1.203 | 0.861 |
| 3.835884630033038 | 1.672 | 0.989 | 0.774 | 1.204 | 0.861 |
| 3.839026222686627 | 1.673 | 0.99 | 0.774 | 1.204 | 0.862 |
| 3.842167815340217 | 1.675 | 0.99 | 0.774 | 1.205 | 0.862 |
| 3.845309407993807 | 1.676 | 0.99 | 0.774 | 1.205 | 0.862 |
| 3.848451000647396 | 1.677 | 0.99 | 0.774 | 1.206 | 0.862 |
| 3.851592593300986 | 1.679 | 0.991 | 0.774 | 1.206 | 0.862 |
| 3.854734185954575 | 1.68 | 0.991 | 0.774 | 1.207 | 0.862 |
| 3.857875778608165 | 1.681 | 0.991 | 0.774 | 1.208 | 0.862 |
| 3.861017371261755 | 1.683 | 0.991 | 0.774 | 1.208 | 0.862 |
| 3.864158963915344 | 1.684 | 0.992 | 0.774 | 1.209 | 0.862 |
| 3.867300556568933 | 1.685 | 0.992 | 0.774 | 1.209 | 0.863 |
| 3.870442149222523 | 1.687 | 0.992 | 0.774 | 1.21 | 0.863 |
| 3.873583741876112 | 1.688 | 0.992 | 0.775 | 1.211 | 0.863 |
| 3.876725334529703 | 1.69 | 0.993 | 0.775 | 1.211 | 0.863 |
| 3.879866927183292 | 1.691 | 0.993 | 0.775 | 1.212 | 0.863 |
| 3.883008519836882 | 1.692 | 0.993 | 0.775 | 1.213 | 0.863 |
| 3.886150112490471 | 1.694 | 0.994 | 0.775 | 1.213 | 0.863 |
| 3.889291705144061 | 1.695 | 0.994 | 0.775 | 1.214 | 0.863 |
| 3.892433297797651 | 1.697 | 0.994 | 0.775 | 1.215 | 0.864 |
| 3.89557489045124 | 1.698 | 0.994 | 0.775 | 1.215 | 0.864 |
| 3.89871648310483 | 1.7 | 0.995 | 0.775 | 1.216 | 0.864 |
| 3.901858075758419 | 1.701 | 0.995 | 0.775 | 1.217 | 0.864 |
| 3.904999668412009 | 1.703 | 0.995 | 0.775 | 1.217 | 0.864 |
| 3.908141261065598 | 1.704 | 0.996 | 0.775 | 1.218 | 0.864 |
| 3.911282853719188 | 1.706 | 0.996 | 0.775 | 1.219 | 0.865 |
| 3.914424446372778 | 1.707 | 0.997 | 0.775 | 1.22 | 0.865 |
| 3.917566039026367 | 1.709 | 0.997 | 0.776 | 1.22 | 0.865 |
| 3.920707631679957 | 1.71 | 0.997 | 0.776 | 1.221 | 0.865 |
| 3.923849224333547 | 1.712 | 0.998 | 0.776 | 1.222 | 0.865 |
| 3.926990816987136 | 1.713 | 0.998 | 0.776 | 1.223 | 0.865 |
| 3.930132409640726 | 1.715 | 0.998 | 0.776 | 1.223 | 0.866 |
| 3.933274002294315 | 1.717 | 0.999 | 0.776 | 1.224 | 0.866 |
| 3.936415594947905 | 1.718 | 0.999 | 0.776 | 1.225 | 0.866 |
| 3.939557187601495 | 1.72 | 1 | 0.776 | 1.226 | 0.866 |
| 3.942698780255084 | 1.721 | 1 | 0.776 | 1.227 | 0.866 |
| 3.945840372908674 | 1.723 | 1.001 | 0.776 | 1.228 | 0.867 |
| 3.948981965562263 | 1.725 | 1.001 | 0.777 | 1.228 | 0.867 |
| 3.952123558215853 | 1.726 | 1.001 | 0.777 | 1.229 | 0.867 |
| 3.955265150869442 | 1.728 | 1.002 | 0.777 | 1.23 | 0.867 |
| 3.958406743523032 | 1.73 | 1.002 | 0.777 | 1.231 | 0.868 |
| 3.961548336176622 | 1.731 | 1.003 | 0.777 | 1.232 | 0.868 |
| 3.964689928830211 | 1.733 | 1.003 | 0.777 | 1.233 | 0.868 |
| 3.967831521483801 | 1.735 | 1.004 | 0.777 | 1.234 | 0.868 |
| 3.97097311413739 | 1.736 | 1.004 | 0.777 | 1.235 | 0.869 |
| 3.97411470679098 | 1.738 | 1.005 | 0.778 | 1.236 | 0.869 |
| 3.97725629944457 | 1.74 | 1.005 | 0.778 | 1.236 | 0.869 |
| 3.98039789209816 | 1.742 | 1.006 | 0.778 | 1.237 | 0.87 |
| 3.983539484751749 | 1.743 | 1.006 | 0.778 | 1.238 | 0.87 |
| 3.986681077405338 | 1.745 | 1.007 | 0.778 | 1.239 | 0.87 |
| 3.989822670058928 | 1.747 | 1.007 | 0.778 | 1.24 | 0.87 |
| 3.992964262712517 | 1.749 | 1.008 | 0.779 | 1.241 | 0.871 |
| 3.996105855366107 | 1.75 | 1.009 | 0.779 | 1.242 | 0.871 |
| 3.999247448019697 | 1.752 | 1.009 | 0.779 | 1.243 | 0.871 |
| 4.002389040673287 | 1.754 | 1.01 | 0.779 | 1.244 | 0.872 |
| 4.005530633326877 | 1.756 | 1.01 | 0.779 | 1.245 | 0.872 |
| 4.008672225980466 | 1.758 | 1.011 | 0.78 | 1.247 | 0.873 |
| 4.011813818634056 | 1.759 | 1.012 | 0.78 | 1.248 | 0.873 |
| 4.014955411287645 | 1.761 | 1.012 | 0.78 | 1.249 | 0.873 |
| 4.018097003941234 | 1.763 | 1.013 | 0.78 | 1.25 | 0.874 |
| 4.021238596594824 | 1.765 | 1.014 | 0.781 | 1.251 | 0.874 |
| 4.024380189248414 | 1.767 | 1.014 | 0.781 | 1.252 | 0.874 |
| 4.027521781902004 | 1.769 | 1.015 | 0.781 | 1.253 | 0.875 |
| 4.030663374555593 | 1.771 | 1.016 | 0.781 | 1.254 | 0.875 |
| 4.033804967209183 | 1.773 | 1.016 | 0.781 | 1.255 | 0.876 |
| 4.036946559862773 | 1.774 | 1.017 | 0.782 | 1.257 | 0.876 |
| 4.040088152516362 | 1.776 | 1.018 | 0.782 | 1.258 | 0.877 |
| 4.043229745169951 | 1.778 | 1.018 | 0.782 | 1.259 | 0.877 |
| 4.046371337823541 | 1.78 | 1.019 | 0.783 | 1.26 | 0.877 |
| 4.049512930477131 | 1.782 | 1.02 | 0.783 | 1.261 | 0.878 |
| 4.05265452313072 | 1.784 | 1.021 | 0.783 | 1.263 | 0.878 |
| 4.05579611578431 | 1.786 | 1.021 | 0.783 | 1.264 | 0.879 |
| 4.0589377084379 | 1.788 | 1.022 | 0.784 | 1.265 | 0.879 |
| 4.062079301091489 | 1.79 | 1.023 | 0.784 | 1.266 | 0.88 |
| 4.065220893745079 | 1.792 | 1.024 | 0.784 | 1.268 | 0.88 |
| 4.068362486398668 | 1.794 | 1.025 | 0.785 | 1.269 | 0.881 |
| 4.071504079052258 | 1.796 | 1.025 | 0.785 | 1.27 | 0.881 |
| 4.074645671705848 | 1.798 | 1.026 | 0.785 | 1.271 | 0.882 |
| 4.077787264359437 | 1.8 | 1.027 | 0.786 | 1.273 | 0.882 |
| 4.080928857013027 | 1.802 | 1.028 | 0.786 | 1.274 | 0.883 |
| 4.084070449666616 | 1.804 | 1.029 | 0.787 | 1.275 | 0.884 |
| 4.087212042320206 | 1.806 | 1.03 | 0.787 | 1.277 | 0.884 |
| 4.090353634973795 | 1.808 | 1.031 | 0.787 | 1.278 | 0.885 |
| 4.093495227627385 | 1.81 | 1.032 | 0.788 | 1.279 | 0.885 |
| 4.096636820280975 | 1.813 | 1.032 | 0.788 | 1.281 | 0.886 |
| 4.099778412934564 | 1.815 | 1.033 | 0.789 | 1.282 | 0.887 |
| 4.102920005588154 | 1.817 | 1.034 | 0.789 | 1.284 | 0.887 |
| 4.106061598241744 | 1.819 | 1.035 | 0.789 | 1.285 | 0.888 |
| 4.109203190895333 | 1.821 | 1.036 | 0.79 | 1.287 | 0.889 |
| 4.112344783548923 | 1.823 | 1.037 | 0.79 | 1.288 | 0.889 |
| 4.115486376202512 | 1.825 | 1.038 | 0.791 | 1.289 | 0.89 |
| 4.118627968856102 | 1.827 | 1.039 | 0.791 | 1.291 | 0.891 |
| 4.121769561509692 | 1.83 | 1.04 | 0.792 | 1.292 | 0.891 |
| 4.124911154163281 | 1.832 | 1.041 | 0.792 | 1.294 | 0.892 |
| 4.128052746816871 | 1.834 | 1.042 | 0.793 | 1.295 | 0.893 |
| 4.13119433947046 | 1.836 | 1.043 | 0.793 | 1.297 | 0.894 |
| 4.13433593212405 | 1.838 | 1.045 | 0.794 | 1.299 | 0.894 |
| 4.13747752477764 | 1.841 | 1.046 | 0.794 | 1.3 | 0.895 |
| 4.14061911743123 | 1.843 | 1.047 | 0.795 | 1.302 | 0.896 |
| 4.143760710084818 | 1.845 | 1.048 | 0.795 | 1.303 | 0.897 |
| 4.146902302738408 | 1.847 | 1.049 | 0.796 | 1.305 | 0.897 |
| 4.150043895391998 | 1.849 | 1.05 | 0.797 | 1.306 | 0.898 |
| 4.153185488045588 | 1.852 | 1.051 | 0.797 | 1.308 | 0.899 |
| 4.156327080699177 | 1.854 | 1.052 | 0.798 | 1.31 | 0.9 |
| 4.159468673352766 | 1.856 | 1.054 | 0.798 | 1.311 | 0.901 |
| 4.162610266006356 | 1.859 | 1.055 | 0.799 | 1.313 | 0.902 |
| 4.165751858659946 | 1.861 | 1.056 | 0.8 | 1.315 | 0.903 |
| 4.168893451313535 | 1.863 | 1.057 | 0.8 | 1.316 | 0.903 |
| 4.172035043967125 | 1.865 | 1.059 | 0.801 | 1.318 | 0.904 |
| 4.175176636620715 | 1.868 | 1.06 | 0.802 | 1.32 | 0.905 |
| 4.178318229274304 | 1.87 | 1.061 | 0.802 | 1.321 | 0.906 |
| 4.181459821927894 | 1.872 | 1.062 | 0.803 | 1.323 | 0.907 |
| 4.184601414581484 | 1.875 | 1.064 | 0.804 | 1.325 | 0.908 |
| 4.187743007235073 | 1.877 | 1.065 | 0.805 | 1.327 | 0.909 |
| 4.190884599888663 | 1.879 | 1.066 | 0.805 | 1.328 | 0.91 |
| 4.194026192542252 | 1.882 | 1.068 | 0.806 | 1.33 | 0.911 |
| 4.197167785195842 | 1.884 | 1.069 | 0.807 | 1.332 | 0.912 |
| 4.200309377849432 | 1.887 | 1.07 | 0.808 | 1.334 | 0.913 |
| 4.203450970503021 | 1.889 | 1.072 | 0.808 | 1.336 | 0.914 |
| 4.206592563156611 | 1.891 | 1.073 | 0.809 | 1.337 | 0.915 |
| 4.2097341558102 | 1.894 | 1.075 | 0.81 | 1.339 | 0.916 |
| 4.21287574846379 | 1.896 | 1.076 | 0.811 | 1.341 | 0.917 |
| 4.21601734111738 | 1.899 | 1.077 | 0.812 | 1.343 | 0.919 |
| 4.21915893377097 | 1.901 | 1.079 | 0.813 | 1.345 | 0.92 |
| 4.222300526424559 | 1.904 | 1.08 | 0.814 | 1.347 | 0.921 |
| 4.225442119078148 | 1.906 | 1.082 | 0.814 | 1.349 | 0.922 |
| 4.228583711731738 | 1.908 | 1.083 | 0.815 | 1.351 | 0.923 |
| 4.231725304385327 | 1.911 | 1.085 | 0.816 | 1.353 | 0.924 |
| 4.234866897038917 | 1.913 | 1.086 | 0.817 | 1.355 | 0.926 |
| 4.238008489692506 | 1.916 | 1.088 | 0.818 | 1.356 | 0.927 |
| 4.241150082346096 | 1.918 | 1.09 | 0.819 | 1.358 | 0.928 |
| 4.244291674999685 | 1.921 | 1.091 | 0.82 | 1.36 | 0.929 |
| 4.247433267653276 | 1.923 | 1.093 | 0.821 | 1.362 | 0.931 |
| 4.250574860306865 | 1.926 | 1.094 | 0.822 | 1.364 | 0.932 |
| 4.253716452960455 | 1.928 | 1.096 | 0.823 | 1.366 | 0.933 |
| 4.256858045614044 | 1.931 | 1.098 | 0.824 | 1.369 | 0.935 |
| 4.259999638267634 | 1.933 | 1.099 | 0.825 | 1.371 | 0.936 |
| 4.263141230921224 | 1.936 | 1.101 | 0.827 | 1.373 | 0.937 |
| 4.266282823574813 | 1.939 | 1.103 | 0.828 | 1.375 | 0.939 |
| 4.269424416228403 | 1.941 | 1.104 | 0.829 | 1.377 | 0.94 |
| 4.272566008881992 | 1.944 | 1.106 | 0.83 | 1.379 | 0.941 |
| 4.275707601535582 | 1.946 | 1.108 | 0.831 | 1.381 | 0.943 |
| 4.27884919418917 | 1.949 | 1.11 | 0.832 | 1.383 | 0.944 |
| 4.28199078684276 | 1.951 | 1.111 | 0.833 | 1.385 | 0.946 |
| 4.285132379496351 | 1.954 | 1.113 | 0.835 | 1.387 | 0.947 |
| 4.28827397214994 | 1.957 | 1.115 | 0.836 | 1.39 | 0.949 |
| 4.29141556480353 | 1.959 | 1.117 | 0.837 | 1.392 | 0.95 |
| 4.294557157457119 | 1.962 | 1.118 | 0.838 | 1.394 | 0.952 |
| 4.29769875011071 | 1.964 | 1.12 | 0.84 | 1.396 | 0.953 |
| 4.300840342764299 | 1.967 | 1.122 | 0.841 | 1.398 | 0.955 |
| 4.303981935417888 | 1.97 | 1.124 | 0.842 | 1.401 | 0.956 |
| 4.307123528071478 | 1.972 | 1.126 | 0.844 | 1.403 | 0.958 |
| 4.310265120725067 | 1.975 | 1.128 | 0.845 | 1.405 | 0.96 |
| 4.313406713378657 | 1.978 | 1.13 | 0.846 | 1.407 | 0.961 |
| 4.316548306032247 | 1.98 | 1.132 | 0.848 | 1.41 | 0.963 |
| 4.319689898685836 | 1.983 | 1.134 | 0.849 | 1.412 | 0.964 |
| 4.322831491339426 | 1.986 | 1.136 | 0.851 | 1.414 | 0.966 |
| 4.325973083993015 | 1.988 | 1.138 | 0.852 | 1.416 | 0.968 |
| 4.329114676646605 | 1.991 | 1.14 | 0.854 | 1.419 | 0.97 |
| 4.332256269300195 | 1.994 | 1.142 | 0.855 | 1.421 | 0.971 |
| 4.335397861953784 | 1.997 | 1.144 | 0.857 | 1.423 | 0.973 |
| 4.338539454607374 | 1.999 | 1.146 | 0.858 | 1.426 | 0.975 |
| 4.341681047260963 | 2.002 | 1.148 | 0.86 | 1.428 | 0.977 |
| 4.344822639914553 | 2.005 | 1.15 | 0.861 | 1.431 | 0.978 |
| 4.347964232568143 | 2.007 | 1.152 | 0.863 | 1.433 | 0.98 |
| 4.351105825221732 | 2.01 | 1.154 | 0.864 | 1.435 | 0.982 |
| 4.354247417875322 | 2.013 | 1.156 | 0.866 | 1.438 | 0.984 |
| 4.357389010528911 | 2.016 | 1.158 | 0.868 | 1.44 | 0.986 |
| 4.360530603182501 | 2.019 | 1.16 | 0.869 | 1.443 | 0.988 |
| 4.36367219583609 | 2.021 | 1.162 | 0.871 | 1.445 | 0.989 |
| 4.36681378848968 | 2.024 | 1.165 | 0.873 | 1.448 | 0.991 |
| 4.36995538114327 | 2.027 | 1.167 | 0.874 | 1.45 | 0.993 |
| 4.373096973796859 | 2.03 | 1.169 | 0.876 | 1.452 | 0.995 |
| 4.376238566450449 | 2.032 | 1.171 | 0.878 | 1.455 | 0.997 |
| 4.379380159104038 | 2.035 | 1.173 | 0.88 | 1.457 | 0.999 |
| 4.382521751757628 | 2.038 | 1.176 | 0.881 | 1.46 | 1.001 |
| 4.385663344411217 | 2.041 | 1.178 | 0.883 | 1.462 | 1.003 |
| 4.388804937064807 | 2.044 | 1.18 | 0.885 | 1.465 | 1.005 |
| 4.391946529718397 | 2.046 | 1.183 | 0.887 | 1.468 | 1.007 |
| 4.395088122371987 | 2.049 | 1.185 | 0.889 | 1.47 | 1.009 |
| 4.398229715025576 | 2.052 | 1.187 | 0.891 | 1.473 | 1.012 |
| 4.401371307679165 | 2.055 | 1.189 | 0.893 | 1.475 | 1.014 |
| 4.404512900332755 | 2.058 | 1.192 | 0.895 | 1.478 | 1.016 |
| 4.407654492986345 | 2.061 | 1.194 | 0.897 | 1.48 | 1.018 |
| 4.410796085639934 | 2.064 | 1.197 | 0.899 | 1.483 | 1.02 |
| 4.413937678293524 | 2.066 | 1.199 | 0.9 | 1.486 | 1.022 |
| 4.417079270947114 | 2.069 | 1.201 | 0.903 | 1.488 | 1.024 |
| 4.420220863600703 | 2.072 | 1.204 | 0.905 | 1.491 | 1.027 |
| 4.423362456254293 | 2.075 | 1.206 | 0.907 | 1.494 | 1.029 |
| 4.426504048907883 | 2.078 | 1.209 | 0.909 | 1.496 | 1.031 |
| 4.429645641561472 | 2.081 | 1.211 | 0.911 | 1.499 | 1.033 |
| 4.432787234215062 | 2.084 | 1.214 | 0.913 | 1.502 | 1.036 |
| 4.435928826868651 | 2.087 | 1.216 | 0.915 | 1.504 | 1.038 |
| 4.43907041952224 | 2.09 | 1.219 | 0.917 | 1.507 | 1.04 |
| 4.44221201217583 | 2.092 | 1.221 | 0.919 | 1.51 | 1.043 |
| 4.44535360482942 | 2.095 | 1.224 | 0.921 | 1.512 | 1.045 |
| 4.44849519748301 | 2.098 | 1.226 | 0.924 | 1.515 | 1.047 |
| 4.4516367901366 | 2.101 | 1.229 | 0.926 | 1.518 | 1.05 |
| 4.454778382790188 | 2.104 | 1.231 | 0.928 | 1.521 | 1.052 |
| 4.457919975443779 | 2.107 | 1.234 | 0.93 | 1.523 | 1.055 |
| 4.461061568097368 | 2.11 | 1.236 | 0.933 | 1.526 | 1.057 |
| 4.464203160750958 | 2.113 | 1.239 | 0.935 | 1.529 | 1.059 |
| 4.467344753404547 | 2.116 | 1.242 | 0.937 | 1.532 | 1.062 |
| 4.470486346058137 | 2.119 | 1.244 | 0.94 | 1.534 | 1.064 |
| 4.473627938711726 | 2.122 | 1.247 | 0.942 | 1.537 | 1.067 |
| 4.476769531365316 | 2.125 | 1.25 | 0.944 | 1.54 | 1.069 |
| 4.479911124018905 | 2.128 | 1.252 | 0.947 | 1.543 | 1.072 |
| 4.483052716672495 | 2.131 | 1.255 | 0.949 | 1.546 | 1.074 |
| 4.486194309326085 | 2.134 | 1.258 | 0.951 | 1.548 | 1.077 |
| 4.489335901979674 | 2.137 | 1.26 | 0.954 | 1.551 | 1.08 |
| 4.492477494633264 | 2.14 | 1.263 | 0.956 | 1.554 | 1.082 |
| 4.495619087286854 | 2.143 | 1.266 | 0.959 | 1.557 | 1.085 |
| 4.498760679940443 | 2.146 | 1.268 | 0.961 | 1.56 | 1.087 |
| 4.501902272594033 | 2.149 | 1.271 | 0.964 | 1.563 | 1.09 |
| 4.505043865247622 | 2.152 | 1.274 | 0.966 | 1.566 | 1.093 |
| 4.508185457901212 | 2.155 | 1.277 | 0.969 | 1.569 | 1.095 |
| 4.511327050554801 | 2.158 | 1.279 | 0.971 | 1.571 | 1.098 |
| 4.514468643208391 | 2.161 | 1.282 | 0.974 | 1.574 | 1.101 |
| 4.517610235861981 | 2.164 | 1.285 | 0.977 | 1.577 | 1.103 |
| 4.520751828515571 | 2.167 | 1.288 | 0.979 | 1.58 | 1.106 |
| 4.52389342116916 | 2.17 | 1.291 | 0.982 | 1.583 | 1.109 |
| 4.52703501382275 | 2.173 | 1.293 | 0.984 | 1.586 | 1.111 |
| 4.530176606476339 | 2.176 | 1.296 | 0.987 | 1.589 | 1.114 |
| 4.533318199129928 | 2.179 | 1.299 | 0.99 | 1.592 | 1.117 |
| 4.536459791783518 | 2.182 | 1.302 | 0.992 | 1.595 | 1.12 |
| 4.539601384437108 | 2.185 | 1.305 | 0.995 | 1.598 | 1.122 |
| 4.542742977090698 | 2.188 | 1.308 | 0.998 | 1.601 | 1.125 |
| 4.545884569744287 | 2.191 | 1.311 | 1.001 | 1.604 | 1.128 |
| 4.549026162397876 | 2.194 | 1.314 | 1.003 | 1.607 | 1.131 |
| 4.552167755051466 | 2.197 | 1.316 | 1.006 | 1.61 | 1.134 |
| 4.555309347705056 | 2.2 | 1.319 | 1.009 | 1.613 | 1.136 |
| 4.558450940358646 | 2.203 | 1.322 | 1.012 | 1.616 | 1.139 |
| 4.561592533012235 | 2.207 | 1.325 | 1.014 | 1.619 | 1.142 |
| 4.564734125665825 | 2.21 | 1.328 | 1.017 | 1.622 | 1.145 |
| 4.567875718319415 | 2.213 | 1.331 | 1.02 | 1.625 | 1.148 |
| 4.571017310973004 | 2.216 | 1.334 | 1.023 | 1.628 | 1.151 |
| 4.574158903626594 | 2.219 | 1.337 | 1.026 | 1.631 | 1.154 |
| 4.577300496280183 | 2.222 | 1.34 | 1.029 | 1.634 | 1.157 |
| 4.580442088933772 | 2.225 | 1.343 | 1.031 | 1.637 | 1.16 |
| 4.583583681587362 | 2.228 | 1.346 | 1.034 | 1.64 | 1.163 |
| 4.586725274240952 | 2.231 | 1.349 | 1.037 | 1.643 | 1.165 |
| 4.589866866894542 | 2.234 | 1.352 | 1.04 | 1.646 | 1.168 |
| 4.593008459548131 | 2.237 | 1.355 | 1.043 | 1.649 | 1.171 |
| 4.596150052201721 | 2.24 | 1.358 | 1.046 | 1.652 | 1.174 |
| 4.59929164485531 | 2.244 | 1.361 | 1.049 | 1.655 | 1.177 |
| 4.6024332375089 | 2.247 | 1.364 | 1.052 | 1.658 | 1.18 |
| 4.60557483016249 | 2.25 | 1.367 | 1.055 | 1.661 | 1.183 |
| 4.608716422816079 | 2.253 | 1.37 | 1.058 | 1.664 | 1.186 |
| 4.611858015469668 | 2.256 | 1.373 | 1.061 | 1.667 | 1.189 |
| 4.614999608123258 | 2.259 | 1.376 | 1.064 | 1.67 | 1.192 |
| 4.618141200776848 | 2.262 | 1.379 | 1.067 | 1.673 | 1.195 |
| 4.621282793430437 | 2.265 | 1.382 | 1.07 | 1.677 | 1.198 |
| 4.624424386084027 | 2.268 | 1.385 | 1.073 | 1.68 | 1.201 |
| 4.627565978737617 | 2.272 | 1.388 | 1.076 | 1.683 | 1.205 |
| 4.630707571391206 | 2.275 | 1.391 | 1.079 | 1.686 | 1.208 |
| 4.633849164044795 | 2.278 | 1.395 | 1.082 | 1.689 | 1.211 |
| 4.636990756698386 | 2.281 | 1.398 | 1.085 | 1.692 | 1.214 |
| 4.640132349351975 | 2.284 | 1.401 | 1.088 | 1.695 | 1.217 |
| 4.643273942005564 | 2.287 | 1.404 | 1.091 | 1.698 | 1.22 |
| 4.646415534659154 | 2.29 | 1.407 | 1.094 | 1.701 | 1.223 |
| 4.649557127312744 | 2.293 | 1.41 | 1.097 | 1.704 | 1.226 |
| 4.652698719966334 | 2.297 | 1.413 | 1.1 | 1.708 | 1.229 |
| 4.655840312619923 | 2.3 | 1.416 | 1.103 | 1.711 | 1.232 |
| 4.658981905273513 | 2.303 | 1.419 | 1.107 | 1.714 | 1.235 |
| 4.662123497927102 | 2.306 | 1.422 | 1.11 | 1.717 | 1.238 |
| 4.665265090580692 | 2.309 | 1.426 | 1.113 | 1.72 | 1.242 |
| 4.668406683234282 | 2.312 | 1.429 | 1.116 | 1.723 | 1.245 |
| 4.671548275887871 | 2.315 | 1.432 | 1.119 | 1.726 | 1.248 |
| 4.674689868541461 | 2.319 | 1.435 | 1.122 | 1.729 | 1.251 |
| 4.67783146119505 | 2.322 | 1.438 | 1.125 | 1.733 | 1.254 |
| 4.68097305384864 | 2.325 | 1.441 | 1.128 | 1.736 | 1.257 |
| 4.68411464650223 | 2.328 | 1.444 | 1.131 | 1.739 | 1.26 |
| 4.687256239155819 | 2.331 | 1.448 | 1.135 | 1.742 | 1.263 |
| 4.690397831809409 | 2.334 | 1.451 | 1.138 | 1.745 | 1.267 |
| 4.693539424462998 | 2.337 | 1.454 | 1.141 | 1.748 | 1.27 |
| 4.696681017116588 | 2.34 | 1.457 | 1.144 | 1.751 | 1.273 |
| 4.699822609770177 | 2.344 | 1.46 | 1.147 | 1.755 | 1.276 |
| 4.702964202423767 | 2.347 | 1.463 | 1.15 | 1.758 | 1.279 |
| 4.706105795077356 | 2.35 | 1.466 | 1.153 | 1.761 | 1.282 |
| 4.709247387730946 | 2.353 | 1.469 | 1.157 | 1.764 | 1.285 |
| 4.712388980384535 | 2.356 | 1.473 | 1.16 | 1.767 | 1.289 |
| 4.715530573038126 | 2.359 | 1.476 | 1.163 | 1.77 | 1.292 |
| 4.718672165691715 | 2.362 | 1.479 | 1.166 | 1.773 | 1.295 |
| 4.721813758345305 | 2.366 | 1.482 | 1.169 | 1.777 | 1.298 |
| 4.724955350998894 | 2.369 | 1.485 | 1.172 | 1.78 | 1.301 |
| 4.728096943652484 | 2.372 | 1.488 | 1.175 | 1.783 | 1.304 |
| 4.731238536306074 | 2.375 | 1.491 | 1.179 | 1.786 | 1.307 |
| 4.734380128959663 | 2.378 | 1.495 | 1.182 | 1.789 | 1.311 |
| 4.737521721613253 | 2.381 | 1.498 | 1.185 | 1.792 | 1.314 |
| 4.740663314266842 | 2.384 | 1.501 | 1.188 | 1.795 | 1.317 |
| 4.743804906920432 | 2.388 | 1.504 | 1.191 | 1.799 | 1.32 |
| 4.74694649957402 | 2.391 | 1.507 | 1.194 | 1.802 | 1.323 |
| 4.750088092227611 | 2.394 | 1.51 | 1.197 | 1.805 | 1.326 |
| 4.7532296848812 | 2.397 | 1.513 | 1.2 | 1.808 | 1.329 |
| 4.75637127753479 | 2.4 | 1.517 | 1.204 | 1.811 | 1.332 |
| 4.75951287018838 | 2.403 | 1.52 | 1.207 | 1.814 | 1.336 |
| 4.76265446284197 | 2.406 | 1.523 | 1.21 | 1.817 | 1.339 |
| 4.765796055495559 | 2.41 | 1.526 | 1.213 | 1.82 | 1.342 |
| 4.768937648149149 | 2.413 | 1.529 | 1.216 | 1.824 | 1.345 |
| 4.772079240802738 | 2.416 | 1.532 | 1.219 | 1.827 | 1.348 |
| 4.775220833456327 | 2.419 | 1.535 | 1.222 | 1.83 | 1.351 |
| 4.778362426109917 | 2.422 | 1.538 | 1.225 | 1.833 | 1.354 |
| 4.781504018763507 | 2.425 | 1.541 | 1.228 | 1.836 | 1.357 |
| 4.784645611417097 | 2.428 | 1.545 | 1.231 | 1.839 | 1.36 |
| 4.787787204070686 | 2.431 | 1.548 | 1.234 | 1.842 | 1.363 |
| 4.790928796724275 | 2.435 | 1.551 | 1.237 | 1.845 | 1.366 |
| 4.794070389377865 | 2.438 | 1.554 | 1.24 | 1.848 | 1.37 |
| 4.797211982031455 | 2.441 | 1.557 | 1.244 | 1.852 | 1.373 |
| 4.800353574685045 | 2.444 | 1.56 | 1.247 | 1.855 | 1.376 |
| 4.803495167338634 | 2.447 | 1.563 | 1.25 | 1.858 | 1.379 |
| 4.806636759992224 | 2.45 | 1.566 | 1.253 | 1.861 | 1.382 |
| 4.809778352645814 | 2.453 | 1.569 | 1.256 | 1.864 | 1.385 |
| 4.812919945299403 | 2.456 | 1.572 | 1.259 | 1.867 | 1.388 |
| 4.816061537952993 | 2.459 | 1.575 | 1.262 | 1.87 | 1.391 |
| 4.819203130606582 | 2.463 | 1.578 | 1.265 | 1.873 | 1.394 |
| 4.822344723260172 | 2.466 | 1.581 | 1.267 | 1.876 | 1.397 |
| 4.825486315913761 | 2.469 | 1.584 | 1.27 | 1.879 | 1.4 |
| 4.828627908567351 | 2.472 | 1.587 | 1.273 | 1.882 | 1.403 |
| 4.83176950122094 | 2.475 | 1.59 | 1.276 | 1.885 | 1.406 |
| 4.83491109387453 | 2.478 | 1.593 | 1.279 | 1.888 | 1.409 |
| 4.83805268652812 | 2.481 | 1.596 | 1.282 | 1.891 | 1.412 |
| 4.841194279181709 | 2.484 | 1.599 | 1.285 | 1.895 | 1.415 |
| 4.844335871835299 | 2.487 | 1.602 | 1.288 | 1.898 | 1.417 |
| 4.847477464488889 | 2.49 | 1.605 | 1.291 | 1.901 | 1.42 |
| 4.850619057142478 | 2.494 | 1.608 | 1.294 | 1.904 | 1.423 |
| 4.853760649796068 | 2.497 | 1.611 | 1.296 | 1.907 | 1.426 |
| 4.856902242449657 | 2.5 | 1.614 | 1.299 | 1.91 | 1.429 |
| 4.860043835103247 | 2.503 | 1.617 | 1.302 | 1.913 | 1.432 |
| 4.863185427756837 | 2.506 | 1.62 | 1.305 | 1.916 | 1.435 |
| 4.866327020410426 | 2.509 | 1.623 | 1.308 | 1.919 | 1.438 |
| 4.869468613064015 | 2.512 | 1.626 | 1.311 | 1.922 | 1.441 |
| 4.872610205717605 | 2.515 | 1.629 | 1.313 | 1.925 | 1.443 |
| 4.875751798371195 | 2.518 | 1.632 | 1.316 | 1.928 | 1.446 |
| 4.878893391024784 | 2.521 | 1.635 | 1.319 | 1.931 | 1.449 |
| 4.882034983678374 | 2.524 | 1.637 | 1.322 | 1.934 | 1.452 |
| 4.885176576331964 | 2.527 | 1.64 | 1.324 | 1.937 | 1.455 |
| 4.888318168985553 | 2.53 | 1.643 | 1.327 | 1.94 | 1.457 |
| 4.891459761639143 | 2.533 | 1.646 | 1.33 | 1.942 | 1.46 |
| 4.894601354292733 | 2.536 | 1.649 | 1.332 | 1.945 | 1.463 |
| 4.897742946946322 | 2.539 | 1.652 | 1.335 | 1.948 | 1.466 |
| 4.900884539599912 | 2.542 | 1.655 | 1.338 | 1.951 | 1.468 |
| 4.904026132253501 | 2.546 | 1.657 | 1.34 | 1.954 | 1.471 |
| 4.907167724907091 | 2.549 | 1.66 | 1.343 | 1.957 | 1.474 |
| 4.91030931756068 | 2.552 | 1.663 | 1.345 | 1.96 | 1.477 |
| 4.91345091021427 | 2.555 | 1.666 | 1.348 | 1.963 | 1.479 |
| 4.91659250286786 | 2.558 | 1.669 | 1.35 | 1.966 | 1.482 |
| 4.91973409552145 | 2.561 | 1.671 | 1.353 | 1.969 | 1.485 |
| 4.922875688175039 | 2.564 | 1.674 | 1.356 | 1.972 | 1.487 |
| 4.926017280828628 | 2.567 | 1.677 | 1.358 | 1.974 | 1.49 |
| 4.929158873482218 | 2.57 | 1.68 | 1.361 | 1.977 | 1.492 |
| 4.932300466135808 | 2.573 | 1.682 | 1.363 | 1.98 | 1.495 |
| 4.935442058789397 | 2.576 | 1.685 | 1.365 | 1.983 | 1.498 |
| 4.938583651442987 | 2.579 | 1.688 | 1.368 | 1.986 | 1.5 |
| 4.941725244096576 | 2.582 | 1.69 | 1.37 | 1.989 | 1.503 |
| 4.944866836750166 | 2.585 | 1.693 | 1.373 | 1.991 | 1.505 |
| 4.948008429403755 | 2.588 | 1.696 | 1.375 | 1.994 | 1.508 |
| 4.951150022057345 | 2.59 | 1.698 | 1.377 | 1.997 | 1.51 |
| 4.954291614710935 | 2.593 | 1.701 | 1.38 | 2 | 1.513 |
| 4.957433207364524 | 2.596 | 1.704 | 1.382 | 2.003 | 1.515 |
| 4.960574800018114 | 2.599 | 1.706 | 1.384 | 2.005 | 1.518 |
| 4.963716392671704 | 2.602 | 1.709 | 1.387 | 2.008 | 1.52 |
| 4.966857985325293 | 2.605 | 1.711 | 1.389 | 2.011 | 1.523 |
| 4.969999577978883 | 2.608 | 1.714 | 1.391 | 2.014 | 1.525 |
| 4.973141170632472 | 2.611 | 1.717 | 1.394 | 2.016 | 1.527 |
| 4.976282763286062 | 2.614 | 1.719 | 1.396 | 2.019 | 1.53 |
| 4.979424355939651 | 2.617 | 1.722 | 1.398 | 2.022 | 1.532 |
| 4.982565948593241 | 2.62 | 1.724 | 1.4 | 2.025 | 1.534 |
| 4.985707541246831 | 2.623 | 1.727 | 1.402 | 2.027 | 1.537 |
| 4.98884913390042 | 2.626 | 1.729 | 1.404 | 2.03 | 1.539 |
| 4.99199072655401 | 2.629 | 1.732 | 1.407 | 2.033 | 1.541 |
| 4.9951323192076 | 2.632 | 1.734 | 1.409 | 2.035 | 1.544 |
| 4.99827391186119 | 2.634 | 1.737 | 1.411 | 2.038 | 1.546 |
| 5.00141550451478 | 2.637 | 1.739 | 1.413 | 2.041 | 1.548 |
| 5.004557097168369 | 2.64 | 1.741 | 1.415 | 2.043 | 1.55 |
| 5.007698689821958 | 2.643 | 1.744 | 1.417 | 2.046 | 1.553 |
| 5.010840282475548 | 2.646 | 1.746 | 1.419 | 2.049 | 1.555 |
| 5.013981875129137 | 2.649 | 1.749 | 1.421 | 2.051 | 1.557 |
| 5.017123467782727 | 2.652 | 1.751 | 1.423 | 2.054 | 1.559 |
| 5.020265060436317 | 2.655 | 1.753 | 1.425 | 2.056 | 1.561 |
| 5.023406653089906 | 2.657 | 1.756 | 1.427 | 2.059 | 1.563 |
| 5.026548245743496 | 2.66 | 1.758 | 1.429 | 2.062 | 1.566 |
| 5.029689838397085 | 2.663 | 1.76 | 1.431 | 2.064 | 1.568 |
| 5.032831431050674 | 2.666 | 1.763 | 1.432 | 2.067 | 1.57 |
| 5.035973023704264 | 2.669 | 1.765 | 1.434 | 2.069 | 1.572 |
| 5.039114616357854 | 2.672 | 1.767 | 1.436 | 2.072 | 1.574 |
| 5.042256209011444 | 2.674 | 1.77 | 1.438 | 2.074 | 1.576 |
| 5.045397801665033 | 2.677 | 1.772 | 1.44 | 2.077 | 1.578 |
| 5.048539394318622 | 2.68 | 1.774 | 1.441 | 2.079 | 1.58 |
| 5.051680986972213 | 2.683 | 1.776 | 1.443 | 2.082 | 1.582 |
| 5.054822579625802 | 2.686 | 1.778 | 1.445 | 2.084 | 1.584 |
| 5.057964172279392 | 2.688 | 1.781 | 1.447 | 2.087 | 1.586 |
| 5.061105764932981 | 2.691 | 1.783 | 1.448 | 2.089 | 1.588 |
| 5.064247357586571 | 2.694 | 1.785 | 1.45 | 2.092 | 1.59 |
| 5.067388950240161 | 2.697 | 1.787 | 1.452 | 2.094 | 1.591 |
| 5.07053054289375 | 2.699 | 1.789 | 1.453 | 2.097 | 1.593 |
| 5.07367213554734 | 2.702 | 1.791 | 1.455 | 2.099 | 1.595 |
| 5.07681372820093 | 2.705 | 1.793 | 1.457 | 2.101 | 1.597 |
| 5.079955320854519 | 2.708 | 1.796 | 1.458 | 2.104 | 1.599 |
| 5.083096913508108 | 2.71 | 1.798 | 1.46 | 2.106 | 1.601 |
| 5.086238506161698 | 2.713 | 1.8 | 1.461 | 2.108 | 1.602 |
| 5.089380098815288 | 2.716 | 1.802 | 1.463 | 2.111 | 1.604 |
| 5.092521691468877 | 2.719 | 1.804 | 1.464 | 2.113 | 1.606 |
| 5.095663284122466 | 2.721 | 1.806 | 1.466 | 2.116 | 1.608 |
| 5.098804876776057 | 2.724 | 1.808 | 1.467 | 2.118 | 1.609 |
| 5.101946469429646 | 2.727 | 1.81 | 1.469 | 2.12 | 1.611 |
| 5.105088062083236 | 2.729 | 1.812 | 1.47 | 2.122 | 1.613 |
| 5.108229654736825 | 2.732 | 1.814 | 1.472 | 2.125 | 1.614 |
| 5.111371247390415 | 2.735 | 1.816 | 1.473 | 2.127 | 1.616 |
| 5.114512840044005 | 2.737 | 1.817 | 1.474 | 2.129 | 1.618 |
| 5.117654432697594 | 2.74 | 1.819 | 1.476 | 2.131 | 1.619 |
| 5.120796025351184 | 2.743 | 1.821 | 1.477 | 2.134 | 1.621 |
| 5.123937618004773 | 2.745 | 1.823 | 1.478 | 2.136 | 1.622 |
| 5.127079210658363 | 2.748 | 1.825 | 1.48 | 2.138 | 1.624 |
| 5.130220803311953 | 2.751 | 1.827 | 1.481 | 2.14 | 1.625 |
| 5.133362395965542 | 2.753 | 1.829 | 1.482 | 2.143 | 1.627 |
| 5.136503988619131 | 2.756 | 1.83 | 1.483 | 2.145 | 1.628 |
| 5.13964558127272 | 2.758 | 1.832 | 1.485 | 2.147 | 1.63 |
| 5.142787173926311 | 2.761 | 1.834 | 1.486 | 2.149 | 1.631 |
| 5.1459287665799 | 2.764 | 1.836 | 1.487 | 2.151 | 1.633 |
| 5.14907035923349 | 2.766 | 1.837 | 1.488 | 2.153 | 1.634 |
| 5.15221195188708 | 2.769 | 1.839 | 1.489 | 2.155 | 1.636 |
| 5.15535354454067 | 2.771 | 1.841 | 1.491 | 2.158 | 1.637 |
| 5.158495137194259 | 2.774 | 1.843 | 1.492 | 2.16 | 1.639 |
| 5.161636729847848 | 2.776 | 1.844 | 1.493 | 2.162 | 1.64 |
| 5.164778322501438 | 2.779 | 1.846 | 1.494 | 2.164 | 1.641 |
| 5.167919915155028 | 2.781 | 1.848 | 1.495 | 2.166 | 1.643 |
| 5.171061507808617 | 2.784 | 1.849 | 1.496 | 2.168 | 1.644 |
| 5.174203100462206 | 2.787 | 1.851 | 1.497 | 2.17 | 1.645 |
| 5.177344693115796 | 2.789 | 1.853 | 1.498 | 2.172 | 1.646 |
| 5.180486285769386 | 2.792 | 1.854 | 1.499 | 2.174 | 1.648 |
| 5.183627878422976 | 2.794 | 1.856 | 1.5 | 2.176 | 1.649 |
| 5.186769471076565 | 2.797 | 1.857 | 1.501 | 2.178 | 1.65 |
| 5.189911063730155 | 2.799 | 1.859 | 1.502 | 2.18 | 1.651 |
| 5.193052656383744 | 2.802 | 1.86 | 1.503 | 2.182 | 1.653 |
| 5.196194249037334 | 2.804 | 1.862 | 1.504 | 2.184 | 1.654 |
| 5.199335841690924 | 2.806 | 1.863 | 1.505 | 2.186 | 1.655 |
| 5.202477434344513 | 2.809 | 1.865 | 1.506 | 2.187 | 1.656 |
| 5.205619026998103 | 2.811 | 1.866 | 1.507 | 2.189 | 1.657 |
| 5.208760619651692 | 2.814 | 1.868 | 1.508 | 2.191 | 1.659 |
| 5.211902212305282 | 2.816 | 1.869 | 1.508 | 2.193 | 1.66 |
| 5.215043804958871 | 2.819 | 1.871 | 1.509 | 2.195 | 1.661 |
| 5.218185397612461 | 2.821 | 1.872 | 1.51 | 2.197 | 1.662 |
| 5.221326990266051 | 2.823 | 1.873 | 1.511 | 2.199 | 1.663 |
| 5.22446858291964 | 2.826 | 1.875 | 1.512 | 2.2 | 1.664 |
| 5.22761017557323 | 2.828 | 1.876 | 1.513 | 2.202 | 1.665 |
| 5.23075176822682 | 2.831 | 1.878 | 1.513 | 2.204 | 1.666 |
| 5.23389336088041 | 2.833 | 1.879 | 1.514 | 2.206 | 1.667 |
| 5.237034953533999 | 2.835 | 1.88 | 1.515 | 2.208 | 1.668 |
| 5.240176546187588 | 2.838 | 1.882 | 1.516 | 2.209 | 1.669 |
| 5.243318138841178 | 2.84 | 1.883 | 1.516 | 2.211 | 1.67 |
| 5.246459731494767 | 2.842 | 1.884 | 1.517 | 2.213 | 1.671 |
| 5.249601324148357 | 2.845 | 1.885 | 1.518 | 2.215 | 1.672 |
| 5.252742916801947 | 2.847 | 1.887 | 1.518 | 2.216 | 1.673 |
| 5.255884509455536 | 2.849 | 1.888 | 1.519 | 2.218 | 1.674 |
| 5.259026102109125 | 2.852 | 1.889 | 1.52 | 2.22 | 1.675 |
| 5.262167694762715 | 2.854 | 1.89 | 1.52 | 2.221 | 1.675 |
| 5.265309287416305 | 2.856 | 1.892 | 1.521 | 2.223 | 1.676 |
| 5.268450880069895 | 2.858 | 1.893 | 1.522 | 2.225 | 1.677 |
| 5.271592472723484 | 2.861 | 1.894 | 1.522 | 2.226 | 1.678 |
| 5.274734065377074 | 2.863 | 1.895 | 1.523 | 2.228 | 1.679 |
| 5.277875658030664 | 2.865 | 1.896 | 1.523 | 2.229 | 1.68 |
| 5.281017250684253 | 2.867 | 1.897 | 1.524 | 2.231 | 1.68 |
| 5.284158843337843 | 2.87 | 1.898 | 1.525 | 2.233 | 1.681 |
| 5.287300435991432 | 2.872 | 1.9 | 1.525 | 2.234 | 1.682 |
| 5.290442028645022 | 2.874 | 1.901 | 1.526 | 2.236 | 1.683 |
| 5.293583621298612 | 2.876 | 1.902 | 1.526 | 2.237 | 1.684 |
| 5.296725213952201 | 2.878 | 1.903 | 1.527 | 2.239 | 1.684 |
| 5.299866806605791 | 2.881 | 1.904 | 1.527 | 2.24 | 1.685 |
| 5.30300839925938 | 2.883 | 1.905 | 1.528 | 2.242 | 1.686 |
| 5.30614999191297 | 2.885 | 1.906 | 1.528 | 2.243 | 1.686 |
| 5.30929158456656 | 2.887 | 1.907 | 1.529 | 2.245 | 1.687 |
| 5.312433177220149 | 2.889 | 1.908 | 1.529 | 2.246 | 1.688 |
| 5.315574769873739 | 2.891 | 1.909 | 1.53 | 2.248 | 1.689 |
| 5.318716362527328 | 2.893 | 1.91 | 1.53 | 2.249 | 1.689 |
| 5.321857955180918 | 2.896 | 1.911 | 1.53 | 2.251 | 1.69 |
| 5.324999547834508 | 2.898 | 1.912 | 1.531 | 2.252 | 1.69 |
| 5.328141140488097 | 2.9 | 1.913 | 1.531 | 2.253 | 1.691 |
| 5.331282733141686 | 2.902 | 1.914 | 1.532 | 2.255 | 1.692 |
| 5.334424325795276 | 2.904 | 1.915 | 1.532 | 2.256 | 1.692 |
| 5.337565918448866 | 2.906 | 1.915 | 1.532 | 2.258 | 1.693 |
| 5.340707511102456 | 2.908 | 1.916 | 1.533 | 2.259 | 1.693 |
| 5.343849103756045 | 2.91 | 1.917 | 1.533 | 2.26 | 1.694 |
| 5.346990696409634 | 2.912 | 1.918 | 1.534 | 2.262 | 1.695 |
| 5.350132289063224 | 2.914 | 1.919 | 1.534 | 2.263 | 1.695 |
| 5.353273881716814 | 2.916 | 1.92 | 1.534 | 2.264 | 1.696 |
| 5.356415474370403 | 2.918 | 1.921 | 1.535 | 2.265 | 1.696 |
| 5.359557067023993 | 2.92 | 1.921 | 1.535 | 2.267 | 1.697 |
| 5.362698659677583 | 2.922 | 1.922 | 1.535 | 2.268 | 1.697 |
| 5.365840252331172 | 2.924 | 1.923 | 1.536 | 2.269 | 1.698 |
| 5.368981844984762 | 2.926 | 1.924 | 1.536 | 2.271 | 1.698 |
| 5.372123437638351 | 2.928 | 1.925 | 1.536 | 2.272 | 1.699 |
| 5.375265030291941 | 2.93 | 1.925 | 1.537 | 2.273 | 1.699 |
| 5.378406622945531 | 2.932 | 1.926 | 1.537 | 2.274 | 1.7 |
| 5.38154821559912 | 2.934 | 1.927 | 1.537 | 2.275 | 1.7 |
| 5.38468980825271 | 2.936 | 1.928 | 1.537 | 2.277 | 1.701 |
| 5.387831400906299 | 2.938 | 1.928 | 1.538 | 2.278 | 1.701 |
| 5.39097299355989 | 2.94 | 1.929 | 1.538 | 2.279 | 1.701 |
| 5.394114586213479 | 2.942 | 1.93 | 1.538 | 2.28 | 1.702 |
| 5.397256178867068 | 2.944 | 1.93 | 1.538 | 2.281 | 1.702 |
| 5.400397771520657 | 2.945 | 1.931 | 1.539 | 2.282 | 1.703 |
| 5.403539364174247 | 2.947 | 1.932 | 1.539 | 2.283 | 1.703 |
| 5.406680956827837 | 2.949 | 1.932 | 1.539 | 2.285 | 1.703 |
| 5.409822549481426 | 2.951 | 1.933 | 1.539 | 2.286 | 1.704 |
| 5.412964142135016 | 2.953 | 1.934 | 1.54 | 2.287 | 1.704 |
| 5.416105734788605 | 2.955 | 1.934 | 1.54 | 2.288 | 1.705 |
| 5.419247327442195 | 2.957 | 1.935 | 1.54 | 2.289 | 1.705 |
| 5.422388920095785 | 2.958 | 1.935 | 1.54 | 2.29 | 1.705 |
| 5.425530512749375 | 2.96 | 1.936 | 1.54 | 2.291 | 1.706 |
| 5.428672105402964 | 2.962 | 1.937 | 1.541 | 2.292 | 1.706 |
| 5.431813698056554 | 2.964 | 1.937 | 1.541 | 2.293 | 1.706 |
| 5.434955290710143 | 2.966 | 1.938 | 1.541 | 2.294 | 1.707 |
| 5.438096883363733 | 2.967 | 1.938 | 1.541 | 2.295 | 1.707 |
| 5.441238476017322 | 2.969 | 1.939 | 1.541 | 2.296 | 1.707 |
| 5.444380068670912 | 2.971 | 1.939 | 1.541 | 2.297 | 1.708 |
| 5.447521661324502 | 2.972 | 1.94 | 1.542 | 2.298 | 1.708 |
| 5.450663253978091 | 2.974 | 1.94 | 1.542 | 2.299 | 1.708 |
| 5.453804846631681 | 2.976 | 1.941 | 1.542 | 2.3 | 1.708 |
| 5.456946439285271 | 2.978 | 1.941 | 1.542 | 2.301 | 1.709 |
| 5.46008803193886 | 2.979 | 1.942 | 1.542 | 2.302 | 1.709 |
| 5.46322962459245 | 2.981 | 1.942 | 1.542 | 2.302 | 1.709 |
| 5.466371217246039 | 2.983 | 1.943 | 1.542 | 2.303 | 1.709 |
| 5.46951280989963 | 2.984 | 1.943 | 1.543 | 2.304 | 1.71 |
| 5.472654402553218 | 2.986 | 1.944 | 1.543 | 2.305 | 1.71 |
| 5.475795995206808 | 2.988 | 1.944 | 1.543 | 2.306 | 1.71 |
| 5.478937587860398 | 2.989 | 1.945 | 1.543 | 2.307 | 1.71 |
| 5.482079180513987 | 2.991 | 1.945 | 1.543 | 2.308 | 1.711 |
| 5.485220773167577 | 2.993 | 1.946 | 1.543 | 2.308 | 1.711 |
| 5.488362365821166 | 2.994 | 1.946 | 1.543 | 2.309 | 1.711 |
| 5.491503958474756 | 2.996 | 1.946 | 1.543 | 2.31 | 1.711 |
| 5.494645551128346 | 2.997 | 1.947 | 1.543 | 2.311 | 1.711 |
| 5.497787143781935 | 2.999 | 1.947 | 1.544 | 2.312 | 1.712 |
| 5.500928736435525 | 3 | 1.948 | 1.544 | 2.312 | 1.712 |
| 5.504070329089115 | 3.002 | 1.948 | 1.544 | 2.313 | 1.712 |
| 5.507211921742704 | 3.004 | 1.948 | 1.544 | 2.314 | 1.712 |
| 5.510353514396294 | 3.005 | 1.949 | 1.544 | 2.315 | 1.712 |
| 5.513495107049883 | 3.007 | 1.949 | 1.544 | 2.315 | 1.713 |
| 5.516636699703473 | 3.008 | 1.949 | 1.544 | 2.316 | 1.713 |
| 5.519778292357062 | 3.01 | 1.95 | 1.544 | 2.317 | 1.713 |
| 5.522919885010652 | 3.011 | 1.95 | 1.544 | 2.318 | 1.713 |
| 5.526061477664242 | 3.013 | 1.95 | 1.544 | 2.318 | 1.713 |
| 5.529203070317831 | 3.014 | 1.951 | 1.544 | 2.319 | 1.713 |
| 5.532344662971421 | 3.016 | 1.951 | 1.545 | 2.32 | 1.714 |
| 5.535486255625011 | 3.017 | 1.951 | 1.545 | 2.32 | 1.714 |
| 5.5386278482786 | 3.018 | 1.952 | 1.545 | 2.321 | 1.714 |
| 5.54176944093219 | 3.02 | 1.952 | 1.545 | 2.322 | 1.714 |
| 5.544911033585779 | 3.021 | 1.952 | 1.545 | 2.322 | 1.714 |
| 5.54805262623937 | 3.023 | 1.953 | 1.545 | 2.323 | 1.714 |
| 5.551194218892959 | 3.024 | 1.953 | 1.545 | 2.324 | 1.714 |
| 5.554335811546548 | 3.026 | 1.953 | 1.545 | 2.324 | 1.714 |
| 5.557477404200137 | 3.027 | 1.953 | 1.545 | 2.325 | 1.715 |
| 5.560618996853727 | 3.028 | 1.954 | 1.545 | 2.325 | 1.715 |
| 5.563760589507317 | 3.03 | 1.954 | 1.545 | 2.326 | 1.715 |
| 5.566902182160906 | 3.031 | 1.954 | 1.545 | 2.327 | 1.715 |
| 5.570043774814496 | 3.032 | 1.954 | 1.545 | 2.327 | 1.715 |
| 5.573185367468086 | 3.034 | 1.955 | 1.545 | 2.328 | 1.715 |
| 5.576326960121675 | 3.035 | 1.955 | 1.545 | 2.328 | 1.715 |
| 5.579468552775264 | 3.036 | 1.955 | 1.545 | 2.329 | 1.715 |
| 5.582610145428854 | 3.038 | 1.955 | 1.545 | 2.329 | 1.715 |
| 5.585751738082444 | 3.039 | 1.956 | 1.545 | 2.33 | 1.716 |
| 5.588893330736034 | 3.04 | 1.956 | 1.545 | 2.331 | 1.716 |
| 5.592034923389623 | 3.042 | 1.956 | 1.545 | 2.331 | 1.716 |
| 5.595176516043213 | 3.043 | 1.956 | 1.545 | 2.332 | 1.716 |
| 5.598318108696803 | 3.044 | 1.956 | 1.546 | 2.332 | 1.716 |
| 5.601459701350392 | 3.045 | 1.957 | 1.546 | 2.333 | 1.716 |
| 5.604601294003982 | 3.047 | 1.957 | 1.546 | 2.333 | 1.716 |
| 5.607742886657571 | 3.048 | 1.957 | 1.546 | 2.334 | 1.716 |
| 5.610884479311161 | 3.049 | 1.957 | 1.546 | 2.334 | 1.716 |
| 5.61402607196475 | 3.05 | 1.957 | 1.546 | 2.335 | 1.716 |
| 5.61716766461834 | 3.051 | 1.958 | 1.546 | 2.335 | 1.716 |
| 5.62030925727193 | 3.053 | 1.958 | 1.546 | 2.335 | 1.716 |
| 5.623450849925519 | 3.054 | 1.958 | 1.546 | 2.336 | 1.716 |
| 5.626592442579109 | 3.055 | 1.958 | 1.546 | 2.336 | 1.716 |
| 5.629734035232698 | 3.056 | 1.958 | 1.546 | 2.337 | 1.717 |
| 5.632875627886288 | 3.057 | 1.958 | 1.546 | 2.337 | 1.717 |
| 5.636017220539878 | 3.059 | 1.959 | 1.546 | 2.338 | 1.717 |
| 5.639158813193467 | 3.06 | 1.959 | 1.546 | 2.338 | 1.717 |
| 5.642300405847057 | 3.061 | 1.959 | 1.546 | 2.338 | 1.717 |
| 5.645441998500646 | 3.062 | 1.959 | 1.546 | 2.339 | 1.717 |
| 5.648583591154236 | 3.063 | 1.959 | 1.546 | 2.339 | 1.717 |
| 5.651725183807825 | 3.064 | 1.959 | 1.546 | 2.34 | 1.717 |
| 5.654866776461415 | 3.065 | 1.959 | 1.546 | 2.34 | 1.717 |
| 5.658008369115005 | 3.066 | 1.96 | 1.546 | 2.34 | 1.717 |
| 5.661149961768594 | 3.067 | 1.96 | 1.546 | 2.341 | 1.717 |
| 5.664291554422184 | 3.068 | 1.96 | 1.546 | 2.341 | 1.717 |
| 5.667433147075774 | 3.069 | 1.96 | 1.546 | 2.341 | 1.717 |
| 5.670574739729363 | 3.071 | 1.96 | 1.546 | 2.342 | 1.717 |
| 5.673716332382953 | 3.072 | 1.96 | 1.546 | 2.342 | 1.717 |
| 5.676857925036542 | 3.073 | 1.96 | 1.546 | 2.342 | 1.717 |
| 5.679999517690132 | 3.074 | 1.96 | 1.546 | 2.343 | 1.717 |
| 5.683141110343721 | 3.075 | 1.96 | 1.546 | 2.343 | 1.717 |
| 5.686282702997311 | 3.076 | 1.961 | 1.546 | 2.343 | 1.717 |
| 5.689424295650901 | 3.077 | 1.961 | 1.546 | 2.344 | 1.717 |
| 5.69256588830449 | 3.078 | 1.961 | 1.546 | 2.344 | 1.717 |
| 5.69570748095808 | 3.079 | 1.961 | 1.546 | 2.344 | 1.717 |
| 5.69884907361167 | 3.079 | 1.961 | 1.546 | 2.345 | 1.717 |
| 5.701990666265259 | 3.08 | 1.961 | 1.546 | 2.345 | 1.717 |
| 5.705132258918849 | 3.081 | 1.961 | 1.546 | 2.345 | 1.718 |
| 5.708273851572438 | 3.082 | 1.961 | 1.546 | 2.345 | 1.718 |
| 5.711415444226028 | 3.083 | 1.961 | 1.546 | 2.346 | 1.718 |
| 5.714557036879618 | 3.084 | 1.961 | 1.546 | 2.346 | 1.718 |
| 5.717698629533207 | 3.085 | 1.961 | 1.546 | 2.346 | 1.718 |
| 5.720840222186797 | 3.086 | 1.962 | 1.546 | 2.347 | 1.718 |
| 5.723981814840386 | 3.087 | 1.962 | 1.546 | 2.347 | 1.718 |
| 5.727123407493976 | 3.088 | 1.962 | 1.546 | 2.347 | 1.718 |
| 5.730265000147565 | 3.089 | 1.962 | 1.546 | 2.347 | 1.718 |
| 5.733406592801155 | 3.089 | 1.962 | 1.546 | 2.347 | 1.718 |
| 5.736548185454744 | 3.09 | 1.962 | 1.546 | 2.348 | 1.718 |
| 5.739689778108334 | 3.091 | 1.962 | 1.546 | 2.348 | 1.718 |
| 5.742831370761924 | 3.092 | 1.962 | 1.546 | 2.348 | 1.718 |
| 5.745972963415514 | 3.093 | 1.962 | 1.546 | 2.348 | 1.718 |
| 5.749114556069103 | 3.094 | 1.962 | 1.546 | 2.349 | 1.718 |
| 5.752256148722693 | 3.094 | 1.962 | 1.546 | 2.349 | 1.718 |
| 5.755397741376282 | 3.095 | 1.962 | 1.546 | 2.349 | 1.718 |
| 5.758539334029872 | 3.096 | 1.962 | 1.546 | 2.349 | 1.718 |
| 5.761680926683462 | 3.097 | 1.962 | 1.546 | 2.349 | 1.718 |
| 5.764822519337051 | 3.098 | 1.962 | 1.546 | 2.35 | 1.718 |
| 5.767964111990641 | 3.098 | 1.962 | 1.546 | 2.35 | 1.718 |
| 5.77110570464423 | 3.099 | 1.962 | 1.546 | 2.35 | 1.718 |
| 5.77424729729782 | 3.1 | 1.962 | 1.546 | 2.35 | 1.718 |
| 5.77738888995141 | 3.101 | 1.963 | 1.546 | 2.35 | 1.718 |
| 5.780530482605 | 3.101 | 1.963 | 1.546 | 2.351 | 1.718 |
| 5.783672075258588 | 3.102 | 1.963 | 1.546 | 2.351 | 1.718 |
| 5.786813667912178 | 3.103 | 1.963 | 1.546 | 2.351 | 1.718 |
| 5.789955260565768 | 3.103 | 1.963 | 1.546 | 2.351 | 1.718 |
| 5.793096853219358 | 3.104 | 1.963 | 1.546 | 2.351 | 1.718 |
| 5.796238445872947 | 3.105 | 1.963 | 1.546 | 2.351 | 1.718 |
| 5.799380038526537 | 3.106 | 1.963 | 1.546 | 2.351 | 1.718 |
| 5.802521631180126 | 3.106 | 1.963 | 1.546 | 2.352 | 1.718 |
| 5.805663223833715 | 3.107 | 1.963 | 1.546 | 2.352 | 1.718 |
| 5.808804816487306 | 3.108 | 1.963 | 1.546 | 2.352 | 1.718 |
| 5.811946409140895 | 3.108 | 1.963 | 1.546 | 2.352 | 1.718 |
| 5.815088001794485 | 3.109 | 1.963 | 1.546 | 2.352 | 1.718 |
| 5.818229594448074 | 3.11 | 1.963 | 1.546 | 2.352 | 1.718 |
| 5.821371187101663 | 3.11 | 1.963 | 1.546 | 2.352 | 1.718 |
| 5.824512779755254 | 3.111 | 1.963 | 1.546 | 2.353 | 1.718 |
| 5.827654372408843 | 3.111 | 1.963 | 1.546 | 2.353 | 1.718 |
| 5.830795965062433 | 3.112 | 1.963 | 1.546 | 2.353 | 1.718 |
| 5.833937557716022 | 3.113 | 1.963 | 1.546 | 2.353 | 1.718 |
| 5.837079150369612 | 3.113 | 1.963 | 1.546 | 2.353 | 1.718 |
| 5.840220743023201 | 3.114 | 1.963 | 1.546 | 2.353 | 1.718 |
| 5.843362335676791 | 3.114 | 1.963 | 1.546 | 2.353 | 1.718 |
| 5.846503928330381 | 3.115 | 1.963 | 1.546 | 2.353 | 1.718 |
| 5.84964552098397 | 3.115 | 1.963 | 1.546 | 2.353 | 1.718 |
| 5.85278711363756 | 3.116 | 1.963 | 1.546 | 2.353 | 1.718 |
| 5.85592870629115 | 3.117 | 1.963 | 1.546 | 2.354 | 1.718 |
| 5.85907029894474 | 3.117 | 1.963 | 1.546 | 2.354 | 1.718 |
| 5.862211891598329 | 3.118 | 1.963 | 1.546 | 2.354 | 1.718 |
| 5.865353484251918 | 3.118 | 1.963 | 1.546 | 2.354 | 1.718 |
| 5.868495076905508 | 3.119 | 1.963 | 1.546 | 2.354 | 1.718 |
| 5.871636669559098 | 3.119 | 1.963 | 1.546 | 2.354 | 1.718 |
| 5.874778262212687 | 3.12 | 1.963 | 1.546 | 2.354 | 1.718 |
| 5.877919854866277 | 3.12 | 1.963 | 1.546 | 2.354 | 1.718 |
| 5.881061447519866 | 3.121 | 1.963 | 1.546 | 2.354 | 1.718 |
| 5.884203040173456 | 3.121 | 1.963 | 1.546 | 2.354 | 1.718 |
| 5.887344632827046 | 3.122 | 1.963 | 1.546 | 2.354 | 1.718 |
| 5.890486225480635 | 3.122 | 1.963 | 1.546 | 2.354 | 1.718 |
| 5.893627818134224 | 3.122 | 1.963 | 1.546 | 2.355 | 1.718 |
| 5.896769410787814 | 3.123 | 1.963 | 1.546 | 2.355 | 1.718 |
| 5.899911003441404 | 3.123 | 1.963 | 1.546 | 2.355 | 1.718 |
| 5.903052596094994 | 3.124 | 1.963 | 1.546 | 2.355 | 1.718 |
| 5.906194188748583 | 3.124 | 1.963 | 1.546 | 2.355 | 1.718 |
| 5.909335781402172 | 3.125 | 1.963 | 1.546 | 2.355 | 1.718 |
| 5.912477374055762 | 3.125 | 1.963 | 1.546 | 2.355 | 1.718 |
| 5.915618966709352 | 3.125 | 1.963 | 1.546 | 2.355 | 1.718 |
| 5.918760559362942 | 3.126 | 1.963 | 1.546 | 2.355 | 1.718 |
| 5.921902152016531 | 3.126 | 1.963 | 1.546 | 2.355 | 1.718 |
| 5.92504374467012 | 3.127 | 1.963 | 1.546 | 2.355 | 1.718 |
| 5.92818533732371 | 3.127 | 1.963 | 1.546 | 2.355 | 1.718 |
| 5.9313269299773 | 3.127 | 1.963 | 1.546 | 2.355 | 1.718 |
| 5.93446852263089 | 3.128 | 1.963 | 1.546 | 2.355 | 1.718 |
| 5.93761011528448 | 3.128 | 1.963 | 1.546 | 2.355 | 1.718 |
| 5.940751707938068 | 3.129 | 1.963 | 1.546 | 2.355 | 1.718 |
| 5.943893300591658 | 3.129 | 1.963 | 1.546 | 2.355 | 1.718 |
| 5.947034893245248 | 3.129 | 1.963 | 1.546 | 2.355 | 1.718 |
| 5.950176485898837 | 3.13 | 1.963 | 1.546 | 2.355 | 1.718 |
| 5.953318078552427 | 3.13 | 1.963 | 1.546 | 2.355 | 1.718 |
| 5.956459671206017 | 3.13 | 1.963 | 1.546 | 2.355 | 1.718 |
| 5.959601263859606 | 3.131 | 1.963 | 1.546 | 2.356 | 1.718 |
| 5.962742856513196 | 3.131 | 1.963 | 1.546 | 2.356 | 1.718 |
| 5.965884449166785 | 3.131 | 1.963 | 1.546 | 2.356 | 1.718 |
| 5.969026041820375 | 3.131 | 1.963 | 1.546 | 2.356 | 1.718 |
| 5.972167634473964 | 3.132 | 1.963 | 1.546 | 2.356 | 1.718 |
| 5.975309227127554 | 3.132 | 1.963 | 1.546 | 2.356 | 1.718 |
| 5.978450819781144 | 3.132 | 1.963 | 1.546 | 2.356 | 1.718 |
| 5.981592412434733 | 3.133 | 1.963 | 1.546 | 2.356 | 1.718 |
| 5.984734005088323 | 3.133 | 1.963 | 1.546 | 2.356 | 1.718 |
| 5.987875597741913 | 3.133 | 1.963 | 1.546 | 2.356 | 1.718 |
| 5.991017190395502 | 3.133 | 1.963 | 1.546 | 2.356 | 1.718 |
| 5.994158783049092 | 3.134 | 1.963 | 1.546 | 2.356 | 1.718 |
| 5.997300375702681 | 3.134 | 1.963 | 1.546 | 2.356 | 1.718 |
| 6.000441968356271 | 3.134 | 1.963 | 1.546 | 2.356 | 1.718 |
| 6.003583561009861 | 3.134 | 1.963 | 1.546 | 2.356 | 1.718 |
| 6.00672515366345 | 3.135 | 1.963 | 1.546 | 2.356 | 1.718 |
| 6.00986674631704 | 3.135 | 1.963 | 1.546 | 2.356 | 1.718 |
| 6.01300833897063 | 3.135 | 1.963 | 1.546 | 2.356 | 1.718 |
| 6.01614993162422 | 3.135 | 1.963 | 1.546 | 2.356 | 1.718 |
| 6.019291524277808 | 3.136 | 1.963 | 1.546 | 2.356 | 1.718 |
| 6.022433116931398 | 3.136 | 1.963 | 1.546 | 2.356 | 1.718 |
| 6.025574709584988 | 3.136 | 1.963 | 1.546 | 2.356 | 1.718 |
| 6.028716302238577 | 3.136 | 1.963 | 1.546 | 2.356 | 1.718 |
| 6.031857894892167 | 3.136 | 1.963 | 1.546 | 2.356 | 1.718 |
| 6.034999487545757 | 3.137 | 1.963 | 1.546 | 2.356 | 1.718 |
| 6.038141080199346 | 3.137 | 1.963 | 1.546 | 2.356 | 1.718 |
| 6.041282672852935 | 3.137 | 1.963 | 1.546 | 2.356 | 1.718 |
| 6.044424265506525 | 3.137 | 1.963 | 1.546 | 2.356 | 1.718 |
| 6.047565858160115 | 3.137 | 1.963 | 1.546 | 2.356 | 1.718 |
| 6.050707450813704 | 3.137 | 1.963 | 1.546 | 2.356 | 1.718 |
| 6.053849043467294 | 3.138 | 1.963 | 1.546 | 2.356 | 1.718 |
| 6.056990636120884 | 3.138 | 1.963 | 1.546 | 2.356 | 1.718 |
| 6.060132228774473 | 3.138 | 1.963 | 1.546 | 2.356 | 1.718 |
| 6.063273821428063 | 3.138 | 1.963 | 1.546 | 2.356 | 1.718 |
| 6.066415414081653 | 3.138 | 1.963 | 1.546 | 2.356 | 1.718 |
| 6.069557006735242 | 3.138 | 1.963 | 1.546 | 2.356 | 1.718 |
| 6.072698599388831 | 3.139 | 1.963 | 1.546 | 2.356 | 1.718 |
| 6.07584019204242 | 3.139 | 1.963 | 1.546 | 2.356 | 1.718 |
| 6.078981784696011 | 3.139 | 1.963 | 1.546 | 2.356 | 1.718 |
| 6.082123377349601 | 3.139 | 1.963 | 1.546 | 2.356 | 1.718 |
| 6.08526497000319 | 3.139 | 1.963 | 1.546 | 2.356 | 1.718 |
| 6.08840656265678 | 3.139 | 1.963 | 1.546 | 2.356 | 1.718 |
| 6.09154815531037 | 3.139 | 1.963 | 1.546 | 2.356 | 1.718 |
| 6.094689747963959 | 3.139 | 1.963 | 1.546 | 2.356 | 1.718 |
| 6.097831340617549 | 3.139 | 1.963 | 1.546 | 2.356 | 1.718 |
| 6.100972933271138 | 3.14 | 1.963 | 1.546 | 2.356 | 1.718 |
| 6.104114525924728 | 3.14 | 1.963 | 1.546 | 2.356 | 1.718 |
| 6.107256118578317 | 3.14 | 1.963 | 1.546 | 2.356 | 1.718 |
| 6.110397711231907 | 3.14 | 1.963 | 1.546 | 2.356 | 1.718 |
| 6.113539303885497 | 3.14 | 1.963 | 1.546 | 2.356 | 1.718 |
| 6.116680896539086 | 3.14 | 1.963 | 1.546 | 2.356 | 1.718 |
| 6.119822489192675 | 3.14 | 1.963 | 1.546 | 2.356 | 1.718 |
| 6.122964081846265 | 3.14 | 1.963 | 1.546 | 2.356 | 1.718 |
| 6.126105674499855 | 3.14 | 1.963 | 1.546 | 2.356 | 1.718 |
| 6.129247267153445 | 3.14 | 1.963 | 1.546 | 2.356 | 1.718 |
| 6.132388859807034 | 3.14 | 1.963 | 1.546 | 2.356 | 1.718 |
| 6.135530452460624 | 3.141 | 1.963 | 1.546 | 2.356 | 1.718 |
| 6.138672045114213 | 3.141 | 1.963 | 1.546 | 2.356 | 1.718 |
| 6.141813637767803 | 3.141 | 1.963 | 1.546 | 2.356 | 1.718 |
| 6.144955230421393 | 3.141 | 1.963 | 1.546 | 2.356 | 1.718 |
| 6.148096823074982 | 3.141 | 1.963 | 1.546 | 2.356 | 1.718 |
| 6.151238415728571 | 3.141 | 1.963 | 1.546 | 2.356 | 1.718 |
| 6.154380008382161 | 3.141 | 1.963 | 1.546 | 2.356 | 1.718 |
| 6.157521601035751 | 3.141 | 1.963 | 1.546 | 2.356 | 1.718 |
| 6.16066319368934 | 3.141 | 1.963 | 1.546 | 2.356 | 1.718 |
| 6.16380478634293 | 3.141 | 1.963 | 1.546 | 2.356 | 1.718 |
| 6.16694637899652 | 3.141 | 1.963 | 1.546 | 2.356 | 1.718 |
| 6.170087971650109 | 3.141 | 1.963 | 1.546 | 2.356 | 1.718 |
| 6.173229564303698 | 3.141 | 1.963 | 1.546 | 2.356 | 1.718 |
| 6.176371156957289 | 3.141 | 1.963 | 1.546 | 2.356 | 1.718 |
| 6.179512749610878 | 3.141 | 1.963 | 1.546 | 2.356 | 1.718 |
| 6.182654342264468 | 3.141 | 1.963 | 1.546 | 2.356 | 1.718 |
| 6.185795934918057 | 3.141 | 1.963 | 1.546 | 2.356 | 1.718 |
| 6.188937527571647 | 3.141 | 1.963 | 1.546 | 2.356 | 1.718 |
| 6.192079120225237 | 3.141 | 1.963 | 1.546 | 2.356 | 1.718 |
| 6.195220712878826 | 3.141 | 1.963 | 1.546 | 2.356 | 1.718 |
| 6.198362305532415 | 3.141 | 1.963 | 1.546 | 2.356 | 1.718 |
| 6.201503898186005 | 3.141 | 1.963 | 1.546 | 2.356 | 1.718 |
| 6.204645490839594 | 3.141 | 1.963 | 1.546 | 2.356 | 1.718 |
| 6.207787083493184 | 3.141 | 1.963 | 1.546 | 2.356 | 1.718 |
| 6.210928676146774 | 3.141 | 1.963 | 1.546 | 2.356 | 1.718 |
| 6.214070268800364 | 3.141 | 1.963 | 1.546 | 2.356 | 1.718 |
| 6.217211861453953 | 3.141 | 1.963 | 1.546 | 2.356 | 1.718 |
| 6.220353454107543 | 3.142 | 1.963 | 1.546 | 2.356 | 1.718 |
| 6.223495046761133 | 3.142 | 1.963 | 1.546 | 2.356 | 1.718 |
| 6.226636639414722 | 3.142 | 1.963 | 1.546 | 2.356 | 1.718 |
| 6.229778232068312 | 3.142 | 1.963 | 1.546 | 2.356 | 1.718 |
| 6.232919824721901 | 3.142 | 1.963 | 1.546 | 2.356 | 1.718 |
| 6.236061417375491 | 3.142 | 1.963 | 1.546 | 2.356 | 1.718 |
| 6.23920301002908 | 3.142 | 1.963 | 1.546 | 2.356 | 1.718 |
| 6.24234460268267 | 3.142 | 1.963 | 1.546 | 2.356 | 1.718 |
| 6.24548619533626 | 3.142 | 1.963 | 1.546 | 2.356 | 1.718 |
| 6.24862778798985 | 3.142 | 1.963 | 1.546 | 2.356 | 1.718 |
| 6.251769380643438 | 3.142 | 1.963 | 1.546 | 2.356 | 1.718 |
| 6.254910973297028 | 3.142 | 1.963 | 1.546 | 2.356 | 1.718 |
| 6.258052565950618 | 3.142 | 1.963 | 1.546 | 2.356 | 1.718 |
| 6.261194158604208 | 3.142 | 1.963 | 1.546 | 2.356 | 1.718 |
| 6.264335751257797 | 3.142 | 1.963 | 1.546 | 2.356 | 1.718 |
| 6.267477343911387 | 3.142 | 1.963 | 1.546 | 2.356 | 1.718 |
| 6.270618936564976 | 3.142 | 1.963 | 1.546 | 2.356 | 1.718 |
| 6.273760529218566 | 3.142 | 1.963 | 1.546 | 2.356 | 1.718 |
| 6.276902121872155 | 3.142 | 1.963 | 1.546 | 2.356 | 1.718 |
| 6.280043714525745 | 3.142 | 1.963 | 1.546 | 2.356 | 1.718 |
| 6.283185307179335 | 3.142 | 1.963 | 1.546 | 2.356 | 1.718 |